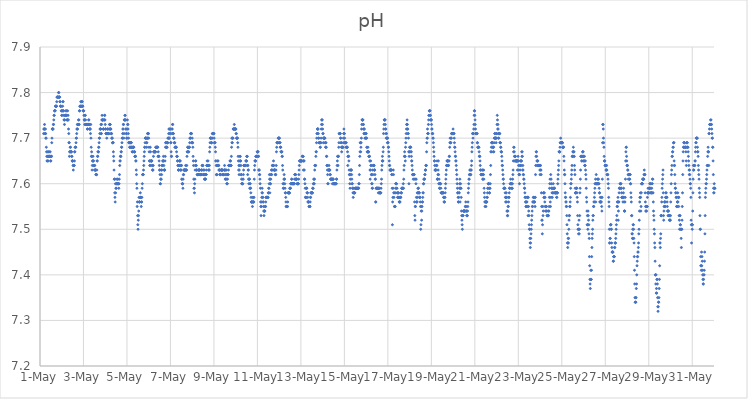
| Category | pH |
|---|---|
| 44317.166666666664 | 7.71 |
| 44317.177083333336 | 7.72 |
| 44317.1875 | 7.72 |
| 44317.197916666664 | 7.72 |
| 44317.208333333336 | 7.73 |
| 44317.21875 | 7.72 |
| 44317.229166666664 | 7.71 |
| 44317.239583333336 | 7.71 |
| 44317.25 | 7.72 |
| 44317.260416666664 | 7.71 |
| 44317.270833333336 | 7.7 |
| 44317.28125 | 7.7 |
| 44317.291666666664 | 7.68 |
| 44317.302083333336 | 7.67 |
| 44317.3125 | 7.66 |
| 44317.322916666664 | 7.65 |
| 44317.333333333336 | 7.65 |
| 44317.34375 | 7.66 |
| 44317.354166666664 | 7.67 |
| 44317.364583333336 | 7.66 |
| 44317.375 | 7.65 |
| 44317.385416666664 | 7.66 |
| 44317.395833333336 | 7.66 |
| 44317.40625 | 7.67 |
| 44317.416666666664 | 7.67 |
| 44317.427083333336 | 7.66 |
| 44317.4375 | 7.66 |
| 44317.447916666664 | 7.66 |
| 44317.458333333336 | 7.66 |
| 44317.46875 | 7.67 |
| 44317.479166666664 | 7.66 |
| 44317.489583333336 | 7.65 |
| 44317.5 | 7.65 |
| 44317.510416666664 | 7.66 |
| 44317.520833333336 | 7.66 |
| 44317.53125 | 7.66 |
| 44317.541666666664 | 7.69 |
| 44317.552083333336 | 7.7 |
| 44317.5625 | 7.72 |
| 44317.572916666664 | 7.72 |
| 44317.583333333336 | 7.72 |
| 44317.59375 | 7.72 |
| 44317.604166666664 | 7.72 |
| 44317.614583333336 | 7.73 |
| 44317.625 | 7.73 |
| 44317.635416666664 | 7.74 |
| 44317.645833333336 | 7.75 |
| 44317.65625 | 7.75 |
| 44317.666666666664 | 7.76 |
| 44317.677083333336 | 7.76 |
| 44317.6875 | 7.76 |
| 44317.697916666664 | 7.76 |
| 44317.708333333336 | 7.77 |
| 44317.71875 | 7.77 |
| 44317.729166666664 | 7.77 |
| 44317.739583333336 | 7.77 |
| 44317.75 | 7.77 |
| 44317.760416666664 | 7.77 |
| 44317.770833333336 | 7.78 |
| 44317.78125 | 7.79 |
| 44317.791666666664 | 7.79 |
| 44317.802083333336 | 7.79 |
| 44317.8125 | 7.79 |
| 44317.822916666664 | 7.79 |
| 44317.833333333336 | 7.79 |
| 44317.84375 | 7.79 |
| 44317.854166666664 | 7.8 |
| 44317.864583333336 | 7.8 |
| 44317.875 | 7.79 |
| 44317.885416666664 | 7.79 |
| 44317.895833333336 | 7.79 |
| 44317.90625 | 7.79 |
| 44317.916666666664 | 7.78 |
| 44317.927083333336 | 7.78 |
| 44317.9375 | 7.77 |
| 44317.947916666664 | 7.77 |
| 44317.958333333336 | 7.77 |
| 44317.96875 | 7.77 |
| 44317.979166666664 | 7.76 |
| 44317.989583333336 | 7.76 |
| 44318.0 | 7.75 |
| 44318.010416666664 | 7.75 |
| 44318.020833333336 | 7.76 |
| 44318.03125 | 7.76 |
| 44318.041666666664 | 7.77 |
| 44318.052083333336 | 7.78 |
| 44318.0625 | 7.78 |
| 44318.072916666664 | 7.76 |
| 44318.083333333336 | 7.76 |
| 44318.09375 | 7.75 |
| 44318.104166666664 | 7.74 |
| 44318.114583333336 | 7.74 |
| 44318.125 | 7.73 |
| 44318.135416666664 | 7.74 |
| 44318.145833333336 | 7.75 |
| 44318.15625 | 7.75 |
| 44318.166666666664 | 7.75 |
| 44318.177083333336 | 7.75 |
| 44318.1875 | 7.76 |
| 44318.197916666664 | 7.75 |
| 44318.208333333336 | 7.75 |
| 44318.21875 | 7.76 |
| 44318.229166666664 | 7.75 |
| 44318.239583333336 | 7.74 |
| 44318.25 | 7.74 |
| 44318.260416666664 | 7.74 |
| 44318.270833333336 | 7.76 |
| 44318.28125 | 7.74 |
| 44318.291666666664 | 7.75 |
| 44318.302083333336 | 7.74 |
| 44318.3125 | 7.72 |
| 44318.322916666664 | 7.71 |
| 44318.333333333336 | 7.69 |
| 44318.34375 | 7.69 |
| 44318.354166666664 | 7.66 |
| 44318.364583333336 | 7.67 |
| 44318.375 | 7.67 |
| 44318.385416666664 | 7.68 |
| 44318.395833333336 | 7.67 |
| 44318.40625 | 7.68 |
| 44318.416666666664 | 7.67 |
| 44318.427083333336 | 7.67 |
| 44318.4375 | 7.67 |
| 44318.447916666664 | 7.67 |
| 44318.458333333336 | 7.66 |
| 44318.46875 | 7.66 |
| 44318.479166666664 | 7.65 |
| 44318.489583333336 | 7.65 |
| 44318.5 | 7.65 |
| 44318.510416666664 | 7.65 |
| 44318.520833333336 | 7.64 |
| 44318.53125 | 7.63 |
| 44318.541666666664 | 7.64 |
| 44318.552083333336 | 7.64 |
| 44318.5625 | 7.64 |
| 44318.572916666664 | 7.64 |
| 44318.583333333336 | 7.65 |
| 44318.59375 | 7.67 |
| 44318.604166666664 | 7.67 |
| 44318.614583333336 | 7.68 |
| 44318.625 | 7.68 |
| 44318.635416666664 | 7.68 |
| 44318.645833333336 | 7.68 |
| 44318.65625 | 7.69 |
| 44318.666666666664 | 7.7 |
| 44318.677083333336 | 7.7 |
| 44318.6875 | 7.71 |
| 44318.697916666664 | 7.72 |
| 44318.708333333336 | 7.72 |
| 44318.71875 | 7.73 |
| 44318.729166666664 | 7.72 |
| 44318.739583333336 | 7.73 |
| 44318.75 | 7.73 |
| 44318.760416666664 | 7.73 |
| 44318.770833333336 | 7.74 |
| 44318.78125 | 7.73 |
| 44318.791666666664 | 7.74 |
| 44318.802083333336 | 7.73 |
| 44318.8125 | 7.76 |
| 44318.822916666664 | 7.76 |
| 44318.833333333336 | 7.77 |
| 44318.84375 | 7.77 |
| 44318.854166666664 | 7.77 |
| 44318.864583333336 | 7.77 |
| 44318.875 | 7.78 |
| 44318.885416666664 | 7.77 |
| 44318.895833333336 | 7.77 |
| 44318.90625 | 7.77 |
| 44318.916666666664 | 7.78 |
| 44318.927083333336 | 7.78 |
| 44318.9375 | 7.78 |
| 44318.947916666664 | 7.77 |
| 44318.958333333336 | 7.77 |
| 44318.96875 | 7.77 |
| 44318.979166666664 | 7.76 |
| 44318.989583333336 | 7.76 |
| 44319.0 | 7.76 |
| 44319.010416666664 | 7.76 |
| 44319.020833333336 | 7.75 |
| 44319.03125 | 7.74 |
| 44319.041666666664 | 7.74 |
| 44319.052083333336 | 7.73 |
| 44319.0625 | 7.74 |
| 44319.072916666664 | 7.75 |
| 44319.083333333336 | 7.75 |
| 44319.09375 | 7.74 |
| 44319.104166666664 | 7.73 |
| 44319.114583333336 | 7.73 |
| 44319.125 | 7.73 |
| 44319.135416666664 | 7.73 |
| 44319.145833333336 | 7.73 |
| 44319.15625 | 7.73 |
| 44319.166666666664 | 7.73 |
| 44319.177083333336 | 7.72 |
| 44319.1875 | 7.72 |
| 44319.197916666664 | 7.73 |
| 44319.208333333336 | 7.73 |
| 44319.21875 | 7.73 |
| 44319.229166666664 | 7.73 |
| 44319.239583333336 | 7.74 |
| 44319.25 | 7.74 |
| 44319.260416666664 | 7.73 |
| 44319.270833333336 | 7.73 |
| 44319.28125 | 7.72 |
| 44319.291666666664 | 7.72 |
| 44319.302083333336 | 7.72 |
| 44319.3125 | 7.72 |
| 44319.322916666664 | 7.71 |
| 44319.333333333336 | 7.73 |
| 44319.34375 | 7.7 |
| 44319.354166666664 | 7.68 |
| 44319.364583333336 | 7.66 |
| 44319.375 | 7.67 |
| 44319.385416666664 | 7.66 |
| 44319.395833333336 | 7.63 |
| 44319.40625 | 7.64 |
| 44319.416666666664 | 7.65 |
| 44319.427083333336 | 7.65 |
| 44319.4375 | 7.66 |
| 44319.447916666664 | 7.65 |
| 44319.458333333336 | 7.65 |
| 44319.46875 | 7.64 |
| 44319.479166666664 | 7.64 |
| 44319.489583333336 | 7.64 |
| 44319.5 | 7.64 |
| 44319.510416666664 | 7.63 |
| 44319.520833333336 | 7.64 |
| 44319.53125 | 7.63 |
| 44319.541666666664 | 7.63 |
| 44319.552083333336 | 7.63 |
| 44319.5625 | 7.63 |
| 44319.572916666664 | 7.62 |
| 44319.583333333336 | 7.62 |
| 44319.59375 | 7.62 |
| 44319.604166666664 | 7.62 |
| 44319.614583333336 | 7.63 |
| 44319.625 | 7.65 |
| 44319.635416666664 | 7.65 |
| 44319.645833333336 | 7.66 |
| 44319.65625 | 7.66 |
| 44319.666666666664 | 7.67 |
| 44319.677083333336 | 7.67 |
| 44319.6875 | 7.67 |
| 44319.697916666664 | 7.68 |
| 44319.708333333336 | 7.68 |
| 44319.71875 | 7.69 |
| 44319.729166666664 | 7.7 |
| 44319.739583333336 | 7.7 |
| 44319.75 | 7.71 |
| 44319.760416666664 | 7.72 |
| 44319.770833333336 | 7.72 |
| 44319.78125 | 7.72 |
| 44319.791666666664 | 7.72 |
| 44319.802083333336 | 7.73 |
| 44319.8125 | 7.71 |
| 44319.822916666664 | 7.71 |
| 44319.833333333336 | 7.73 |
| 44319.84375 | 7.74 |
| 44319.854166666664 | 7.75 |
| 44319.864583333336 | 7.74 |
| 44319.875 | 7.74 |
| 44319.885416666664 | 7.74 |
| 44319.895833333336 | 7.74 |
| 44319.90625 | 7.72 |
| 44319.916666666664 | 7.72 |
| 44319.927083333336 | 7.72 |
| 44319.9375 | 7.74 |
| 44319.947916666664 | 7.74 |
| 44319.958333333336 | 7.74 |
| 44319.96875 | 7.75 |
| 44319.979166666664 | 7.75 |
| 44319.989583333336 | 7.74 |
| 44320.0 | 7.73 |
| 44320.010416666664 | 7.72 |
| 44320.020833333336 | 7.72 |
| 44320.03125 | 7.71 |
| 44320.041666666664 | 7.71 |
| 44320.052083333336 | 7.71 |
| 44320.0625 | 7.71 |
| 44320.072916666664 | 7.7 |
| 44320.083333333336 | 7.71 |
| 44320.09375 | 7.71 |
| 44320.104166666664 | 7.72 |
| 44320.114583333336 | 7.72 |
| 44320.125 | 7.71 |
| 44320.135416666664 | 7.71 |
| 44320.145833333336 | 7.71 |
| 44320.15625 | 7.71 |
| 44320.166666666664 | 7.71 |
| 44320.177083333336 | 7.72 |
| 44320.1875 | 7.72 |
| 44320.197916666664 | 7.73 |
| 44320.208333333336 | 7.73 |
| 44320.21875 | 7.73 |
| 44320.229166666664 | 7.73 |
| 44320.239583333336 | 7.72 |
| 44320.25 | 7.72 |
| 44320.260416666664 | 7.72 |
| 44320.270833333336 | 7.71 |
| 44320.28125 | 7.71 |
| 44320.291666666664 | 7.71 |
| 44320.302083333336 | 7.7 |
| 44320.3125 | 7.7 |
| 44320.322916666664 | 7.7 |
| 44320.333333333336 | 7.69 |
| 44320.34375 | 7.69 |
| 44320.354166666664 | 7.69 |
| 44320.364583333336 | 7.69 |
| 44320.375 | 7.67 |
| 44320.385416666664 | 7.66 |
| 44320.395833333336 | 7.65 |
| 44320.40625 | 7.63 |
| 44320.416666666664 | 7.61 |
| 44320.427083333336 | 7.61 |
| 44320.4375 | 7.58 |
| 44320.447916666664 | 7.57 |
| 44320.458333333336 | 7.56 |
| 44320.46875 | 7.6 |
| 44320.479166666664 | 7.58 |
| 44320.489583333336 | 7.59 |
| 44320.5 | 7.61 |
| 44320.510416666664 | 7.59 |
| 44320.520833333336 | 7.6 |
| 44320.53125 | 7.6 |
| 44320.541666666664 | 7.6 |
| 44320.552083333336 | 7.6 |
| 44320.5625 | 7.6 |
| 44320.572916666664 | 7.61 |
| 44320.583333333336 | 7.61 |
| 44320.59375 | 7.6 |
| 44320.604166666664 | 7.6 |
| 44320.614583333336 | 7.6 |
| 44320.625 | 7.59 |
| 44320.635416666664 | 7.6 |
| 44320.645833333336 | 7.61 |
| 44320.65625 | 7.62 |
| 44320.666666666664 | 7.64 |
| 44320.677083333336 | 7.65 |
| 44320.6875 | 7.65 |
| 44320.697916666664 | 7.66 |
| 44320.708333333336 | 7.66 |
| 44320.71875 | 7.66 |
| 44320.729166666664 | 7.67 |
| 44320.739583333336 | 7.67 |
| 44320.75 | 7.68 |
| 44320.760416666664 | 7.68 |
| 44320.770833333336 | 7.69 |
| 44320.78125 | 7.7 |
| 44320.791666666664 | 7.7 |
| 44320.802083333336 | 7.71 |
| 44320.8125 | 7.72 |
| 44320.822916666664 | 7.72 |
| 44320.833333333336 | 7.73 |
| 44320.84375 | 7.73 |
| 44320.854166666664 | 7.7 |
| 44320.864583333336 | 7.71 |
| 44320.875 | 7.74 |
| 44320.885416666664 | 7.74 |
| 44320.895833333336 | 7.74 |
| 44320.90625 | 7.75 |
| 44320.916666666664 | 7.75 |
| 44320.927083333336 | 7.74 |
| 44320.9375 | 7.74 |
| 44320.947916666664 | 7.72 |
| 44320.958333333336 | 7.72 |
| 44320.96875 | 7.71 |
| 44320.979166666664 | 7.71 |
| 44320.989583333336 | 7.7 |
| 44321.0 | 7.7 |
| 44321.010416666664 | 7.72 |
| 44321.020833333336 | 7.74 |
| 44321.03125 | 7.73 |
| 44321.041666666664 | 7.73 |
| 44321.052083333336 | 7.72 |
| 44321.0625 | 7.71 |
| 44321.072916666664 | 7.7 |
| 44321.083333333336 | 7.69 |
| 44321.09375 | 7.69 |
| 44321.104166666664 | 7.69 |
| 44321.114583333336 | 7.69 |
| 44321.125 | 7.68 |
| 44321.135416666664 | 7.68 |
| 44321.145833333336 | 7.68 |
| 44321.15625 | 7.68 |
| 44321.166666666664 | 7.69 |
| 44321.177083333336 | 7.69 |
| 44321.1875 | 7.69 |
| 44321.197916666664 | 7.69 |
| 44321.208333333336 | 7.68 |
| 44321.21875 | 7.68 |
| 44321.229166666664 | 7.68 |
| 44321.239583333336 | 7.67 |
| 44321.25 | 7.67 |
| 44321.260416666664 | 7.68 |
| 44321.270833333336 | 7.68 |
| 44321.28125 | 7.68 |
| 44321.291666666664 | 7.68 |
| 44321.302083333336 | 7.68 |
| 44321.3125 | 7.68 |
| 44321.322916666664 | 7.67 |
| 44321.333333333336 | 7.67 |
| 44321.34375 | 7.67 |
| 44321.354166666664 | 7.67 |
| 44321.364583333336 | 7.66 |
| 44321.375 | 7.66 |
| 44321.385416666664 | 7.66 |
| 44321.395833333336 | 7.66 |
| 44321.40625 | 7.65 |
| 44321.416666666664 | 7.65 |
| 44321.427083333336 | 7.63 |
| 44321.4375 | 7.62 |
| 44321.447916666664 | 7.6 |
| 44321.458333333336 | 7.59 |
| 44321.46875 | 7.55 |
| 44321.479166666664 | 7.56 |
| 44321.489583333336 | 7.53 |
| 44321.5 | 7.51 |
| 44321.510416666664 | 7.5 |
| 44321.520833333336 | 7.52 |
| 44321.53125 | 7.53 |
| 44321.541666666664 | 7.54 |
| 44321.552083333336 | 7.57 |
| 44321.5625 | 7.56 |
| 44321.572916666664 | 7.56 |
| 44321.583333333336 | 7.56 |
| 44321.59375 | 7.57 |
| 44321.604166666664 | 7.57 |
| 44321.614583333336 | 7.58 |
| 44321.625 | 7.57 |
| 44321.635416666664 | 7.57 |
| 44321.645833333336 | 7.57 |
| 44321.65625 | 7.55 |
| 44321.666666666664 | 7.56 |
| 44321.677083333336 | 7.56 |
| 44321.6875 | 7.57 |
| 44321.697916666664 | 7.59 |
| 44321.708333333336 | 7.6 |
| 44321.71875 | 7.62 |
| 44321.729166666664 | 7.62 |
| 44321.739583333336 | 7.62 |
| 44321.75 | 7.62 |
| 44321.760416666664 | 7.63 |
| 44321.770833333336 | 7.64 |
| 44321.78125 | 7.65 |
| 44321.791666666664 | 7.66 |
| 44321.802083333336 | 7.67 |
| 44321.8125 | 7.68 |
| 44321.822916666664 | 7.68 |
| 44321.833333333336 | 7.69 |
| 44321.84375 | 7.7 |
| 44321.854166666664 | 7.7 |
| 44321.864583333336 | 7.7 |
| 44321.875 | 7.7 |
| 44321.885416666664 | 7.7 |
| 44321.895833333336 | 7.69 |
| 44321.90625 | 7.68 |
| 44321.916666666664 | 7.69 |
| 44321.927083333336 | 7.7 |
| 44321.9375 | 7.7 |
| 44321.947916666664 | 7.71 |
| 44321.958333333336 | 7.71 |
| 44321.96875 | 7.7 |
| 44321.979166666664 | 7.71 |
| 44321.989583333336 | 7.71 |
| 44322.0 | 7.7 |
| 44322.010416666664 | 7.68 |
| 44322.020833333336 | 7.67 |
| 44322.03125 | 7.65 |
| 44322.041666666664 | 7.65 |
| 44322.052083333336 | 7.64 |
| 44322.0625 | 7.64 |
| 44322.072916666664 | 7.68 |
| 44322.083333333336 | 7.67 |
| 44322.09375 | 7.65 |
| 44322.104166666664 | 7.65 |
| 44322.114583333336 | 7.65 |
| 44322.125 | 7.65 |
| 44322.135416666664 | 7.65 |
| 44322.145833333336 | 7.65 |
| 44322.15625 | 7.64 |
| 44322.166666666664 | 7.64 |
| 44322.177083333336 | 7.63 |
| 44322.1875 | 7.63 |
| 44322.197916666664 | 7.63 |
| 44322.208333333336 | 7.64 |
| 44322.21875 | 7.66 |
| 44322.229166666664 | 7.67 |
| 44322.239583333336 | 7.67 |
| 44322.25 | 7.67 |
| 44322.260416666664 | 7.67 |
| 44322.270833333336 | 7.67 |
| 44322.28125 | 7.67 |
| 44322.291666666664 | 7.67 |
| 44322.302083333336 | 7.67 |
| 44322.3125 | 7.67 |
| 44322.322916666664 | 7.68 |
| 44322.333333333336 | 7.68 |
| 44322.34375 | 7.68 |
| 44322.354166666664 | 7.68 |
| 44322.364583333336 | 7.68 |
| 44322.375 | 7.68 |
| 44322.385416666664 | 7.68 |
| 44322.395833333336 | 7.68 |
| 44322.40625 | 7.68 |
| 44322.416666666664 | 7.68 |
| 44322.427083333336 | 7.66 |
| 44322.4375 | 7.67 |
| 44322.447916666664 | 7.66 |
| 44322.458333333336 | 7.66 |
| 44322.46875 | 7.66 |
| 44322.479166666664 | 7.65 |
| 44322.489583333336 | 7.64 |
| 44322.5 | 7.63 |
| 44322.510416666664 | 7.63 |
| 44322.520833333336 | 7.62 |
| 44322.53125 | 7.6 |
| 44322.541666666664 | 7.6 |
| 44322.552083333336 | 7.61 |
| 44322.5625 | 7.61 |
| 44322.572916666664 | 7.61 |
| 44322.583333333336 | 7.63 |
| 44322.59375 | 7.62 |
| 44322.604166666664 | 7.63 |
| 44322.614583333336 | 7.64 |
| 44322.625 | 7.64 |
| 44322.635416666664 | 7.64 |
| 44322.645833333336 | 7.65 |
| 44322.65625 | 7.65 |
| 44322.666666666664 | 7.65 |
| 44322.677083333336 | 7.66 |
| 44322.6875 | 7.65 |
| 44322.697916666664 | 7.64 |
| 44322.708333333336 | 7.63 |
| 44322.71875 | 7.63 |
| 44322.729166666664 | 7.63 |
| 44322.739583333336 | 7.63 |
| 44322.75 | 7.65 |
| 44322.760416666664 | 7.66 |
| 44322.770833333336 | 7.68 |
| 44322.78125 | 7.69 |
| 44322.791666666664 | 7.69 |
| 44322.802083333336 | 7.69 |
| 44322.8125 | 7.68 |
| 44322.822916666664 | 7.68 |
| 44322.833333333336 | 7.68 |
| 44322.84375 | 7.68 |
| 44322.854166666664 | 7.69 |
| 44322.864583333336 | 7.69 |
| 44322.875 | 7.69 |
| 44322.885416666664 | 7.7 |
| 44322.895833333336 | 7.7 |
| 44322.90625 | 7.7 |
| 44322.916666666664 | 7.71 |
| 44322.927083333336 | 7.72 |
| 44322.9375 | 7.7 |
| 44322.947916666664 | 7.7 |
| 44322.958333333336 | 7.71 |
| 44322.96875 | 7.72 |
| 44322.979166666664 | 7.72 |
| 44322.989583333336 | 7.72 |
| 44323.0 | 7.71 |
| 44323.010416666664 | 7.69 |
| 44323.020833333336 | 7.69 |
| 44323.03125 | 7.67 |
| 44323.041666666664 | 7.66 |
| 44323.052083333336 | 7.66 |
| 44323.0625 | 7.72 |
| 44323.072916666664 | 7.71 |
| 44323.083333333336 | 7.72 |
| 44323.09375 | 7.73 |
| 44323.104166666664 | 7.73 |
| 44323.114583333336 | 7.71 |
| 44323.125 | 7.71 |
| 44323.135416666664 | 7.71 |
| 44323.145833333336 | 7.7 |
| 44323.15625 | 7.7 |
| 44323.166666666664 | 7.7 |
| 44323.177083333336 | 7.69 |
| 44323.1875 | 7.69 |
| 44323.197916666664 | 7.69 |
| 44323.208333333336 | 7.68 |
| 44323.21875 | 7.68 |
| 44323.229166666664 | 7.68 |
| 44323.239583333336 | 7.68 |
| 44323.25 | 7.68 |
| 44323.260416666664 | 7.68 |
| 44323.270833333336 | 7.68 |
| 44323.28125 | 7.67 |
| 44323.291666666664 | 7.66 |
| 44323.302083333336 | 7.66 |
| 44323.3125 | 7.66 |
| 44323.322916666664 | 7.65 |
| 44323.333333333336 | 7.65 |
| 44323.34375 | 7.64 |
| 44323.354166666664 | 7.64 |
| 44323.364583333336 | 7.63 |
| 44323.375 | 7.63 |
| 44323.385416666664 | 7.63 |
| 44323.395833333336 | 7.64 |
| 44323.40625 | 7.64 |
| 44323.416666666664 | 7.65 |
| 44323.427083333336 | 7.65 |
| 44323.4375 | 7.65 |
| 44323.447916666664 | 7.65 |
| 44323.458333333336 | 7.63 |
| 44323.46875 | 7.64 |
| 44323.479166666664 | 7.63 |
| 44323.489583333336 | 7.63 |
| 44323.5 | 7.64 |
| 44323.510416666664 | 7.64 |
| 44323.520833333336 | 7.61 |
| 44323.53125 | 7.61 |
| 44323.541666666664 | 7.6 |
| 44323.552083333336 | 7.6 |
| 44323.5625 | 7.6 |
| 44323.572916666664 | 7.59 |
| 44323.583333333336 | 7.61 |
| 44323.59375 | 7.62 |
| 44323.604166666664 | 7.62 |
| 44323.614583333336 | 7.63 |
| 44323.625 | 7.63 |
| 44323.635416666664 | 7.63 |
| 44323.645833333336 | 7.63 |
| 44323.65625 | 7.63 |
| 44323.666666666664 | 7.63 |
| 44323.677083333336 | 7.63 |
| 44323.6875 | 7.63 |
| 44323.697916666664 | 7.64 |
| 44323.708333333336 | 7.63 |
| 44323.71875 | 7.63 |
| 44323.729166666664 | 7.63 |
| 44323.739583333336 | 7.63 |
| 44323.75 | 7.64 |
| 44323.760416666664 | 7.66 |
| 44323.770833333336 | 7.67 |
| 44323.78125 | 7.67 |
| 44323.791666666664 | 7.68 |
| 44323.802083333336 | 7.68 |
| 44323.8125 | 7.68 |
| 44323.822916666664 | 7.67 |
| 44323.833333333336 | 7.68 |
| 44323.84375 | 7.67 |
| 44323.854166666664 | 7.68 |
| 44323.864583333336 | 7.68 |
| 44323.875 | 7.68 |
| 44323.885416666664 | 7.69 |
| 44323.895833333336 | 7.7 |
| 44323.90625 | 7.7 |
| 44323.916666666664 | 7.7 |
| 44323.927083333336 | 7.71 |
| 44323.9375 | 7.71 |
| 44323.947916666664 | 7.71 |
| 44323.958333333336 | 7.71 |
| 44323.96875 | 7.71 |
| 44323.979166666664 | 7.69 |
| 44323.989583333336 | 7.69 |
| 44324.0 | 7.7 |
| 44324.010416666664 | 7.69 |
| 44324.020833333336 | 7.69 |
| 44324.03125 | 7.68 |
| 44324.041666666664 | 7.66 |
| 44324.052083333336 | 7.65 |
| 44324.0625 | 7.64 |
| 44324.072916666664 | 7.61 |
| 44324.083333333336 | 7.59 |
| 44324.09375 | 7.59 |
| 44324.104166666664 | 7.58 |
| 44324.114583333336 | 7.6 |
| 44324.125 | 7.61 |
| 44324.135416666664 | 7.63 |
| 44324.145833333336 | 7.64 |
| 44324.15625 | 7.65 |
| 44324.166666666664 | 7.65 |
| 44324.177083333336 | 7.64 |
| 44324.1875 | 7.64 |
| 44324.197916666664 | 7.63 |
| 44324.208333333336 | 7.63 |
| 44324.21875 | 7.63 |
| 44324.229166666664 | 7.62 |
| 44324.239583333336 | 7.62 |
| 44324.25 | 7.62 |
| 44324.260416666664 | 7.62 |
| 44324.270833333336 | 7.62 |
| 44324.28125 | 7.62 |
| 44324.291666666664 | 7.63 |
| 44324.302083333336 | 7.63 |
| 44324.3125 | 7.63 |
| 44324.322916666664 | 7.63 |
| 44324.333333333336 | 7.63 |
| 44324.34375 | 7.63 |
| 44324.354166666664 | 7.62 |
| 44324.364583333336 | 7.62 |
| 44324.375 | 7.62 |
| 44324.385416666664 | 7.62 |
| 44324.395833333336 | 7.62 |
| 44324.40625 | 7.62 |
| 44324.416666666664 | 7.62 |
| 44324.427083333336 | 7.63 |
| 44324.4375 | 7.63 |
| 44324.447916666664 | 7.63 |
| 44324.458333333336 | 7.64 |
| 44324.46875 | 7.64 |
| 44324.479166666664 | 7.64 |
| 44324.489583333336 | 7.64 |
| 44324.5 | 7.62 |
| 44324.510416666664 | 7.62 |
| 44324.520833333336 | 7.63 |
| 44324.53125 | 7.62 |
| 44324.541666666664 | 7.62 |
| 44324.552083333336 | 7.63 |
| 44324.5625 | 7.61 |
| 44324.572916666664 | 7.62 |
| 44324.583333333336 | 7.61 |
| 44324.59375 | 7.61 |
| 44324.604166666664 | 7.61 |
| 44324.614583333336 | 7.61 |
| 44324.625 | 7.62 |
| 44324.635416666664 | 7.62 |
| 44324.645833333336 | 7.62 |
| 44324.65625 | 7.63 |
| 44324.666666666664 | 7.64 |
| 44324.677083333336 | 7.64 |
| 44324.6875 | 7.65 |
| 44324.697916666664 | 7.64 |
| 44324.708333333336 | 7.64 |
| 44324.71875 | 7.64 |
| 44324.729166666664 | 7.65 |
| 44324.739583333336 | 7.64 |
| 44324.75 | 7.64 |
| 44324.760416666664 | 7.63 |
| 44324.770833333336 | 7.63 |
| 44324.78125 | 7.63 |
| 44324.791666666664 | 7.64 |
| 44324.802083333336 | 7.67 |
| 44324.8125 | 7.68 |
| 44324.822916666664 | 7.69 |
| 44324.833333333336 | 7.7 |
| 44324.84375 | 7.7 |
| 44324.854166666664 | 7.7 |
| 44324.864583333336 | 7.7 |
| 44324.875 | 7.69 |
| 44324.885416666664 | 7.69 |
| 44324.895833333336 | 7.69 |
| 44324.90625 | 7.7 |
| 44324.916666666664 | 7.7 |
| 44324.927083333336 | 7.71 |
| 44324.9375 | 7.71 |
| 44324.947916666664 | 7.71 |
| 44324.958333333336 | 7.71 |
| 44324.96875 | 7.71 |
| 44324.979166666664 | 7.71 |
| 44324.989583333336 | 7.71 |
| 44325.0 | 7.71 |
| 44325.010416666664 | 7.7 |
| 44325.020833333336 | 7.69 |
| 44325.03125 | 7.69 |
| 44325.041666666664 | 7.69 |
| 44325.052083333336 | 7.69 |
| 44325.0625 | 7.68 |
| 44325.072916666664 | 7.67 |
| 44325.083333333336 | 7.65 |
| 44325.09375 | 7.65 |
| 44325.104166666664 | 7.64 |
| 44325.114583333336 | 7.62 |
| 44325.125 | 7.62 |
| 44325.135416666664 | 7.62 |
| 44325.145833333336 | 7.64 |
| 44325.15625 | 7.64 |
| 44325.166666666664 | 7.64 |
| 44325.177083333336 | 7.65 |
| 44325.1875 | 7.65 |
| 44325.197916666664 | 7.64 |
| 44325.208333333336 | 7.64 |
| 44325.21875 | 7.64 |
| 44325.229166666664 | 7.63 |
| 44325.239583333336 | 7.63 |
| 44325.25 | 7.63 |
| 44325.260416666664 | 7.63 |
| 44325.270833333336 | 7.62 |
| 44325.28125 | 7.62 |
| 44325.291666666664 | 7.62 |
| 44325.302083333336 | 7.62 |
| 44325.3125 | 7.62 |
| 44325.322916666664 | 7.63 |
| 44325.333333333336 | 7.63 |
| 44325.34375 | 7.63 |
| 44325.354166666664 | 7.63 |
| 44325.364583333336 | 7.63 |
| 44325.375 | 7.63 |
| 44325.385416666664 | 7.63 |
| 44325.395833333336 | 7.63 |
| 44325.40625 | 7.62 |
| 44325.416666666664 | 7.62 |
| 44325.427083333336 | 7.62 |
| 44325.4375 | 7.62 |
| 44325.447916666664 | 7.62 |
| 44325.458333333336 | 7.62 |
| 44325.46875 | 7.63 |
| 44325.479166666664 | 7.63 |
| 44325.489583333336 | 7.64 |
| 44325.5 | 7.63 |
| 44325.510416666664 | 7.63 |
| 44325.520833333336 | 7.61 |
| 44325.53125 | 7.61 |
| 44325.541666666664 | 7.62 |
| 44325.552083333336 | 7.63 |
| 44325.5625 | 7.63 |
| 44325.572916666664 | 7.62 |
| 44325.583333333336 | 7.61 |
| 44325.59375 | 7.6 |
| 44325.604166666664 | 7.6 |
| 44325.614583333336 | 7.6 |
| 44325.625 | 7.61 |
| 44325.635416666664 | 7.62 |
| 44325.645833333336 | 7.62 |
| 44325.65625 | 7.62 |
| 44325.666666666664 | 7.63 |
| 44325.677083333336 | 7.64 |
| 44325.6875 | 7.64 |
| 44325.697916666664 | 7.64 |
| 44325.708333333336 | 7.64 |
| 44325.71875 | 7.64 |
| 44325.729166666664 | 7.64 |
| 44325.739583333336 | 7.65 |
| 44325.75 | 7.65 |
| 44325.760416666664 | 7.65 |
| 44325.770833333336 | 7.64 |
| 44325.78125 | 7.64 |
| 44325.791666666664 | 7.64 |
| 44325.802083333336 | 7.66 |
| 44325.8125 | 7.68 |
| 44325.822916666664 | 7.7 |
| 44325.833333333336 | 7.69 |
| 44325.84375 | 7.69 |
| 44325.854166666664 | 7.7 |
| 44325.864583333336 | 7.7 |
| 44325.875 | 7.7 |
| 44325.885416666664 | 7.72 |
| 44325.895833333336 | 7.72 |
| 44325.90625 | 7.72 |
| 44325.916666666664 | 7.72 |
| 44325.927083333336 | 7.72 |
| 44325.9375 | 7.73 |
| 44325.947916666664 | 7.72 |
| 44325.958333333336 | 7.72 |
| 44325.96875 | 7.72 |
| 44325.979166666664 | 7.72 |
| 44325.989583333336 | 7.72 |
| 44326.0 | 7.72 |
| 44326.010416666664 | 7.72 |
| 44326.020833333336 | 7.71 |
| 44326.03125 | 7.71 |
| 44326.041666666664 | 7.7 |
| 44326.052083333336 | 7.7 |
| 44326.0625 | 7.7 |
| 44326.072916666664 | 7.7 |
| 44326.083333333336 | 7.7 |
| 44326.09375 | 7.69 |
| 44326.104166666664 | 7.68 |
| 44326.114583333336 | 7.66 |
| 44326.125 | 7.65 |
| 44326.135416666664 | 7.63 |
| 44326.145833333336 | 7.64 |
| 44326.15625 | 7.62 |
| 44326.166666666664 | 7.63 |
| 44326.177083333336 | 7.64 |
| 44326.1875 | 7.65 |
| 44326.197916666664 | 7.66 |
| 44326.208333333336 | 7.66 |
| 44326.21875 | 7.65 |
| 44326.229166666664 | 7.65 |
| 44326.239583333336 | 7.64 |
| 44326.25 | 7.62 |
| 44326.260416666664 | 7.62 |
| 44326.270833333336 | 7.61 |
| 44326.28125 | 7.6 |
| 44326.291666666664 | 7.6 |
| 44326.302083333336 | 7.6 |
| 44326.3125 | 7.6 |
| 44326.322916666664 | 7.6 |
| 44326.333333333336 | 7.61 |
| 44326.34375 | 7.61 |
| 44326.354166666664 | 7.62 |
| 44326.364583333336 | 7.63 |
| 44326.375 | 7.64 |
| 44326.385416666664 | 7.64 |
| 44326.395833333336 | 7.64 |
| 44326.40625 | 7.64 |
| 44326.416666666664 | 7.64 |
| 44326.427083333336 | 7.64 |
| 44326.4375 | 7.64 |
| 44326.447916666664 | 7.64 |
| 44326.458333333336 | 7.64 |
| 44326.46875 | 7.65 |
| 44326.479166666664 | 7.65 |
| 44326.489583333336 | 7.65 |
| 44326.5 | 7.65 |
| 44326.510416666664 | 7.66 |
| 44326.520833333336 | 7.66 |
| 44326.53125 | 7.66 |
| 44326.541666666664 | 7.64 |
| 44326.552083333336 | 7.62 |
| 44326.5625 | 7.64 |
| 44326.572916666664 | 7.63 |
| 44326.583333333336 | 7.63 |
| 44326.59375 | 7.61 |
| 44326.604166666664 | 7.6 |
| 44326.614583333336 | 7.61 |
| 44326.625 | 7.61 |
| 44326.635416666664 | 7.61 |
| 44326.645833333336 | 7.59 |
| 44326.65625 | 7.6 |
| 44326.666666666664 | 7.6 |
| 44326.677083333336 | 7.59 |
| 44326.6875 | 7.59 |
| 44326.697916666664 | 7.58 |
| 44326.708333333336 | 7.57 |
| 44326.71875 | 7.56 |
| 44326.729166666664 | 7.56 |
| 44326.739583333336 | 7.56 |
| 44326.75 | 7.56 |
| 44326.760416666664 | 7.56 |
| 44326.770833333336 | 7.55 |
| 44326.78125 | 7.56 |
| 44326.791666666664 | 7.57 |
| 44326.802083333336 | 7.57 |
| 44326.8125 | 7.56 |
| 44326.822916666664 | 7.56 |
| 44326.833333333336 | 7.56 |
| 44326.84375 | 7.57 |
| 44326.854166666664 | 7.61 |
| 44326.864583333336 | 7.63 |
| 44326.875 | 7.64 |
| 44326.885416666664 | 7.65 |
| 44326.895833333336 | 7.65 |
| 44326.90625 | 7.65 |
| 44326.916666666664 | 7.65 |
| 44326.927083333336 | 7.66 |
| 44326.9375 | 7.66 |
| 44326.947916666664 | 7.66 |
| 44326.958333333336 | 7.66 |
| 44326.96875 | 7.66 |
| 44326.979166666664 | 7.66 |
| 44326.989583333336 | 7.67 |
| 44327.0 | 7.67 |
| 44327.010416666664 | 7.67 |
| 44327.020833333336 | 7.67 |
| 44327.03125 | 7.67 |
| 44327.041666666664 | 7.66 |
| 44327.052083333336 | 7.66 |
| 44327.0625 | 7.63 |
| 44327.072916666664 | 7.63 |
| 44327.083333333336 | 7.63 |
| 44327.09375 | 7.62 |
| 44327.104166666664 | 7.62 |
| 44327.114583333336 | 7.61 |
| 44327.125 | 7.6 |
| 44327.135416666664 | 7.59 |
| 44327.145833333336 | 7.56 |
| 44327.15625 | 7.55 |
| 44327.166666666664 | 7.53 |
| 44327.177083333336 | 7.55 |
| 44327.1875 | 7.56 |
| 44327.197916666664 | 7.57 |
| 44327.208333333336 | 7.58 |
| 44327.21875 | 7.59 |
| 44327.229166666664 | 7.58 |
| 44327.239583333336 | 7.57 |
| 44327.25 | 7.57 |
| 44327.260416666664 | 7.56 |
| 44327.270833333336 | 7.56 |
| 44327.28125 | 7.55 |
| 44327.291666666664 | 7.54 |
| 44327.302083333336 | 7.53 |
| 44327.3125 | 7.54 |
| 44327.322916666664 | 7.54 |
| 44327.333333333336 | 7.54 |
| 44327.34375 | 7.54 |
| 44327.354166666664 | 7.55 |
| 44327.364583333336 | 7.55 |
| 44327.375 | 7.55 |
| 44327.385416666664 | 7.56 |
| 44327.395833333336 | 7.57 |
| 44327.40625 | 7.57 |
| 44327.416666666664 | 7.57 |
| 44327.427083333336 | 7.57 |
| 44327.4375 | 7.57 |
| 44327.447916666664 | 7.57 |
| 44327.458333333336 | 7.57 |
| 44327.46875 | 7.57 |
| 44327.479166666664 | 7.57 |
| 44327.489583333336 | 7.57 |
| 44327.5 | 7.58 |
| 44327.510416666664 | 7.58 |
| 44327.520833333336 | 7.59 |
| 44327.53125 | 7.59 |
| 44327.541666666664 | 7.6 |
| 44327.552083333336 | 7.62 |
| 44327.5625 | 7.61 |
| 44327.572916666664 | 7.58 |
| 44327.583333333336 | 7.61 |
| 44327.59375 | 7.6 |
| 44327.604166666664 | 7.6 |
| 44327.614583333336 | 7.61 |
| 44327.625 | 7.62 |
| 44327.635416666664 | 7.62 |
| 44327.645833333336 | 7.63 |
| 44327.65625 | 7.62 |
| 44327.666666666664 | 7.63 |
| 44327.677083333336 | 7.63 |
| 44327.6875 | 7.64 |
| 44327.697916666664 | 7.64 |
| 44327.708333333336 | 7.64 |
| 44327.71875 | 7.64 |
| 44327.729166666664 | 7.64 |
| 44327.739583333336 | 7.65 |
| 44327.75 | 7.64 |
| 44327.760416666664 | 7.63 |
| 44327.770833333336 | 7.63 |
| 44327.78125 | 7.63 |
| 44327.791666666664 | 7.63 |
| 44327.802083333336 | 7.63 |
| 44327.8125 | 7.63 |
| 44327.822916666664 | 7.62 |
| 44327.833333333336 | 7.62 |
| 44327.84375 | 7.62 |
| 44327.854166666664 | 7.63 |
| 44327.864583333336 | 7.64 |
| 44327.875 | 7.67 |
| 44327.885416666664 | 7.68 |
| 44327.895833333336 | 7.69 |
| 44327.90625 | 7.69 |
| 44327.916666666664 | 7.69 |
| 44327.927083333336 | 7.69 |
| 44327.9375 | 7.69 |
| 44327.947916666664 | 7.69 |
| 44327.958333333336 | 7.7 |
| 44327.96875 | 7.7 |
| 44327.979166666664 | 7.7 |
| 44327.989583333336 | 7.7 |
| 44328.0 | 7.7 |
| 44328.010416666664 | 7.7 |
| 44328.020833333336 | 7.69 |
| 44328.03125 | 7.69 |
| 44328.041666666664 | 7.69 |
| 44328.052083333336 | 7.68 |
| 44328.0625 | 7.68 |
| 44328.072916666664 | 7.68 |
| 44328.083333333336 | 7.67 |
| 44328.09375 | 7.67 |
| 44328.104166666664 | 7.67 |
| 44328.114583333336 | 7.67 |
| 44328.125 | 7.67 |
| 44328.135416666664 | 7.66 |
| 44328.145833333336 | 7.66 |
| 44328.15625 | 7.64 |
| 44328.166666666664 | 7.63 |
| 44328.177083333336 | 7.6 |
| 44328.1875 | 7.59 |
| 44328.197916666664 | 7.6 |
| 44328.208333333336 | 7.59 |
| 44328.21875 | 7.61 |
| 44328.229166666664 | 7.62 |
| 44328.239583333336 | 7.61 |
| 44328.25 | 7.61 |
| 44328.260416666664 | 7.6 |
| 44328.270833333336 | 7.59 |
| 44328.28125 | 7.58 |
| 44328.291666666664 | 7.58 |
| 44328.302083333336 | 7.57 |
| 44328.3125 | 7.56 |
| 44328.322916666664 | 7.55 |
| 44328.333333333336 | 7.55 |
| 44328.34375 | 7.55 |
| 44328.354166666664 | 7.55 |
| 44328.364583333336 | 7.55 |
| 44328.375 | 7.55 |
| 44328.385416666664 | 7.55 |
| 44328.395833333336 | 7.56 |
| 44328.40625 | 7.58 |
| 44328.416666666664 | 7.58 |
| 44328.427083333336 | 7.58 |
| 44328.4375 | 7.58 |
| 44328.447916666664 | 7.58 |
| 44328.458333333336 | 7.58 |
| 44328.46875 | 7.58 |
| 44328.479166666664 | 7.58 |
| 44328.489583333336 | 7.59 |
| 44328.5 | 7.59 |
| 44328.510416666664 | 7.59 |
| 44328.520833333336 | 7.59 |
| 44328.53125 | 7.6 |
| 44328.541666666664 | 7.6 |
| 44328.552083333336 | 7.6 |
| 44328.5625 | 7.6 |
| 44328.572916666664 | 7.61 |
| 44328.583333333336 | 7.61 |
| 44328.59375 | 7.6 |
| 44328.604166666664 | 7.6 |
| 44328.614583333336 | 7.6 |
| 44328.625 | 7.6 |
| 44328.635416666664 | 7.6 |
| 44328.645833333336 | 7.6 |
| 44328.65625 | 7.6 |
| 44328.666666666664 | 7.6 |
| 44328.677083333336 | 7.6 |
| 44328.6875 | 7.6 |
| 44328.697916666664 | 7.6 |
| 44328.708333333336 | 7.61 |
| 44328.71875 | 7.62 |
| 44328.729166666664 | 7.62 |
| 44328.739583333336 | 7.62 |
| 44328.75 | 7.61 |
| 44328.760416666664 | 7.62 |
| 44328.770833333336 | 7.61 |
| 44328.78125 | 7.61 |
| 44328.791666666664 | 7.61 |
| 44328.802083333336 | 7.61 |
| 44328.8125 | 7.61 |
| 44328.822916666664 | 7.6 |
| 44328.833333333336 | 7.6 |
| 44328.84375 | 7.6 |
| 44328.854166666664 | 7.6 |
| 44328.864583333336 | 7.6 |
| 44328.875 | 7.6 |
| 44328.885416666664 | 7.6 |
| 44328.895833333336 | 7.61 |
| 44328.90625 | 7.62 |
| 44328.916666666664 | 7.63 |
| 44328.927083333336 | 7.64 |
| 44328.9375 | 7.65 |
| 44328.947916666664 | 7.65 |
| 44328.958333333336 | 7.65 |
| 44328.96875 | 7.65 |
| 44328.979166666664 | 7.65 |
| 44328.989583333336 | 7.65 |
| 44329.0 | 7.65 |
| 44329.010416666664 | 7.65 |
| 44329.020833333336 | 7.65 |
| 44329.03125 | 7.65 |
| 44329.041666666664 | 7.65 |
| 44329.052083333336 | 7.65 |
| 44329.0625 | 7.66 |
| 44329.072916666664 | 7.66 |
| 44329.083333333336 | 7.66 |
| 44329.09375 | 7.66 |
| 44329.104166666664 | 7.66 |
| 44329.114583333336 | 7.63 |
| 44329.125 | 7.65 |
| 44329.135416666664 | 7.65 |
| 44329.145833333336 | 7.65 |
| 44329.15625 | 7.63 |
| 44329.166666666664 | 7.61 |
| 44329.177083333336 | 7.61 |
| 44329.1875 | 7.6 |
| 44329.197916666664 | 7.59 |
| 44329.208333333336 | 7.57 |
| 44329.21875 | 7.57 |
| 44329.229166666664 | 7.57 |
| 44329.239583333336 | 7.57 |
| 44329.25 | 7.59 |
| 44329.260416666664 | 7.59 |
| 44329.270833333336 | 7.59 |
| 44329.28125 | 7.58 |
| 44329.291666666664 | 7.58 |
| 44329.302083333336 | 7.58 |
| 44329.3125 | 7.57 |
| 44329.322916666664 | 7.56 |
| 44329.333333333336 | 7.56 |
| 44329.34375 | 7.56 |
| 44329.354166666664 | 7.56 |
| 44329.364583333336 | 7.56 |
| 44329.375 | 7.55 |
| 44329.385416666664 | 7.55 |
| 44329.395833333336 | 7.55 |
| 44329.40625 | 7.55 |
| 44329.416666666664 | 7.55 |
| 44329.427083333336 | 7.56 |
| 44329.4375 | 7.57 |
| 44329.447916666664 | 7.57 |
| 44329.458333333336 | 7.58 |
| 44329.46875 | 7.58 |
| 44329.479166666664 | 7.58 |
| 44329.489583333336 | 7.58 |
| 44329.5 | 7.58 |
| 44329.510416666664 | 7.58 |
| 44329.520833333336 | 7.58 |
| 44329.53125 | 7.58 |
| 44329.541666666664 | 7.59 |
| 44329.552083333336 | 7.59 |
| 44329.5625 | 7.59 |
| 44329.572916666664 | 7.6 |
| 44329.583333333336 | 7.6 |
| 44329.59375 | 7.61 |
| 44329.604166666664 | 7.61 |
| 44329.614583333336 | 7.6 |
| 44329.625 | 7.61 |
| 44329.635416666664 | 7.63 |
| 44329.645833333336 | 7.64 |
| 44329.65625 | 7.64 |
| 44329.666666666664 | 7.64 |
| 44329.677083333336 | 7.64 |
| 44329.6875 | 7.66 |
| 44329.697916666664 | 7.67 |
| 44329.708333333336 | 7.67 |
| 44329.71875 | 7.69 |
| 44329.729166666664 | 7.7 |
| 44329.739583333336 | 7.71 |
| 44329.75 | 7.71 |
| 44329.760416666664 | 7.72 |
| 44329.770833333336 | 7.72 |
| 44329.78125 | 7.72 |
| 44329.791666666664 | 7.72 |
| 44329.802083333336 | 7.71 |
| 44329.8125 | 7.7 |
| 44329.822916666664 | 7.7 |
| 44329.833333333336 | 7.69 |
| 44329.84375 | 7.69 |
| 44329.854166666664 | 7.69 |
| 44329.864583333336 | 7.69 |
| 44329.875 | 7.69 |
| 44329.885416666664 | 7.68 |
| 44329.895833333336 | 7.68 |
| 44329.90625 | 7.69 |
| 44329.916666666664 | 7.69 |
| 44329.927083333336 | 7.7 |
| 44329.9375 | 7.72 |
| 44329.947916666664 | 7.73 |
| 44329.958333333336 | 7.74 |
| 44329.96875 | 7.74 |
| 44329.979166666664 | 7.74 |
| 44329.989583333336 | 7.73 |
| 44330.0 | 7.72 |
| 44330.010416666664 | 7.71 |
| 44330.020833333336 | 7.71 |
| 44330.03125 | 7.69 |
| 44330.041666666664 | 7.7 |
| 44330.052083333336 | 7.7 |
| 44330.0625 | 7.7 |
| 44330.072916666664 | 7.7 |
| 44330.083333333336 | 7.7 |
| 44330.09375 | 7.7 |
| 44330.104166666664 | 7.7 |
| 44330.114583333336 | 7.69 |
| 44330.125 | 7.69 |
| 44330.135416666664 | 7.68 |
| 44330.145833333336 | 7.68 |
| 44330.15625 | 7.69 |
| 44330.166666666664 | 7.68 |
| 44330.177083333336 | 7.66 |
| 44330.1875 | 7.66 |
| 44330.197916666664 | 7.64 |
| 44330.208333333336 | 7.64 |
| 44330.21875 | 7.63 |
| 44330.229166666664 | 7.62 |
| 44330.239583333336 | 7.6 |
| 44330.25 | 7.6 |
| 44330.260416666664 | 7.63 |
| 44330.270833333336 | 7.63 |
| 44330.28125 | 7.63 |
| 44330.291666666664 | 7.64 |
| 44330.302083333336 | 7.63 |
| 44330.3125 | 7.63 |
| 44330.322916666664 | 7.63 |
| 44330.333333333336 | 7.63 |
| 44330.34375 | 7.62 |
| 44330.354166666664 | 7.62 |
| 44330.364583333336 | 7.61 |
| 44330.375 | 7.61 |
| 44330.385416666664 | 7.61 |
| 44330.395833333336 | 7.61 |
| 44330.40625 | 7.61 |
| 44330.416666666664 | 7.61 |
| 44330.427083333336 | 7.61 |
| 44330.4375 | 7.61 |
| 44330.447916666664 | 7.6 |
| 44330.458333333336 | 7.61 |
| 44330.46875 | 7.61 |
| 44330.479166666664 | 7.61 |
| 44330.489583333336 | 7.61 |
| 44330.5 | 7.6 |
| 44330.510416666664 | 7.6 |
| 44330.520833333336 | 7.6 |
| 44330.53125 | 7.6 |
| 44330.541666666664 | 7.6 |
| 44330.552083333336 | 7.6 |
| 44330.5625 | 7.6 |
| 44330.572916666664 | 7.6 |
| 44330.583333333336 | 7.6 |
| 44330.59375 | 7.6 |
| 44330.604166666664 | 7.6 |
| 44330.614583333336 | 7.6 |
| 44330.625 | 7.6 |
| 44330.635416666664 | 7.61 |
| 44330.645833333336 | 7.61 |
| 44330.65625 | 7.63 |
| 44330.666666666664 | 7.64 |
| 44330.677083333336 | 7.65 |
| 44330.6875 | 7.66 |
| 44330.697916666664 | 7.66 |
| 44330.708333333336 | 7.64 |
| 44330.71875 | 7.66 |
| 44330.729166666664 | 7.66 |
| 44330.739583333336 | 7.68 |
| 44330.75 | 7.69 |
| 44330.760416666664 | 7.71 |
| 44330.770833333336 | 7.71 |
| 44330.78125 | 7.71 |
| 44330.791666666664 | 7.71 |
| 44330.802083333336 | 7.71 |
| 44330.8125 | 7.71 |
| 44330.822916666664 | 7.7 |
| 44330.833333333336 | 7.7 |
| 44330.84375 | 7.69 |
| 44330.854166666664 | 7.69 |
| 44330.864583333336 | 7.68 |
| 44330.875 | 7.67 |
| 44330.885416666664 | 7.68 |
| 44330.895833333336 | 7.68 |
| 44330.90625 | 7.68 |
| 44330.916666666664 | 7.68 |
| 44330.927083333336 | 7.68 |
| 44330.9375 | 7.68 |
| 44330.947916666664 | 7.69 |
| 44330.958333333336 | 7.7 |
| 44330.96875 | 7.71 |
| 44330.979166666664 | 7.72 |
| 44330.989583333336 | 7.71 |
| 44331.0 | 7.71 |
| 44331.010416666664 | 7.7 |
| 44331.020833333336 | 7.69 |
| 44331.03125 | 7.69 |
| 44331.041666666664 | 7.69 |
| 44331.052083333336 | 7.69 |
| 44331.0625 | 7.69 |
| 44331.072916666664 | 7.68 |
| 44331.083333333336 | 7.69 |
| 44331.09375 | 7.68 |
| 44331.104166666664 | 7.68 |
| 44331.114583333336 | 7.68 |
| 44331.125 | 7.68 |
| 44331.135416666664 | 7.68 |
| 44331.145833333336 | 7.67 |
| 44331.15625 | 7.64 |
| 44331.166666666664 | 7.66 |
| 44331.177083333336 | 7.66 |
| 44331.1875 | 7.66 |
| 44331.197916666664 | 7.66 |
| 44331.208333333336 | 7.65 |
| 44331.21875 | 7.63 |
| 44331.229166666664 | 7.62 |
| 44331.239583333336 | 7.62 |
| 44331.25 | 7.6 |
| 44331.260416666664 | 7.59 |
| 44331.270833333336 | 7.61 |
| 44331.28125 | 7.62 |
| 44331.291666666664 | 7.63 |
| 44331.302083333336 | 7.63 |
| 44331.3125 | 7.63 |
| 44331.322916666664 | 7.63 |
| 44331.333333333336 | 7.62 |
| 44331.34375 | 7.61 |
| 44331.354166666664 | 7.6 |
| 44331.364583333336 | 7.6 |
| 44331.375 | 7.59 |
| 44331.385416666664 | 7.59 |
| 44331.395833333336 | 7.58 |
| 44331.40625 | 7.57 |
| 44331.416666666664 | 7.58 |
| 44331.427083333336 | 7.59 |
| 44331.4375 | 7.58 |
| 44331.447916666664 | 7.58 |
| 44331.458333333336 | 7.58 |
| 44331.46875 | 7.58 |
| 44331.479166666664 | 7.58 |
| 44331.489583333336 | 7.59 |
| 44331.5 | 7.59 |
| 44331.510416666664 | 7.59 |
| 44331.520833333336 | 7.59 |
| 44331.53125 | 7.59 |
| 44331.541666666664 | 7.59 |
| 44331.552083333336 | 7.59 |
| 44331.5625 | 7.59 |
| 44331.572916666664 | 7.59 |
| 44331.583333333336 | 7.59 |
| 44331.59375 | 7.59 |
| 44331.604166666664 | 7.59 |
| 44331.614583333336 | 7.59 |
| 44331.625 | 7.59 |
| 44331.635416666664 | 7.59 |
| 44331.645833333336 | 7.59 |
| 44331.65625 | 7.59 |
| 44331.666666666664 | 7.6 |
| 44331.677083333336 | 7.6 |
| 44331.6875 | 7.62 |
| 44331.697916666664 | 7.64 |
| 44331.708333333336 | 7.66 |
| 44331.71875 | 7.67 |
| 44331.729166666664 | 7.69 |
| 44331.739583333336 | 7.69 |
| 44331.75 | 7.67 |
| 44331.760416666664 | 7.68 |
| 44331.770833333336 | 7.69 |
| 44331.78125 | 7.7 |
| 44331.791666666664 | 7.72 |
| 44331.802083333336 | 7.73 |
| 44331.8125 | 7.74 |
| 44331.822916666664 | 7.74 |
| 44331.833333333336 | 7.74 |
| 44331.84375 | 7.74 |
| 44331.854166666664 | 7.74 |
| 44331.864583333336 | 7.73 |
| 44331.875 | 7.73 |
| 44331.885416666664 | 7.72 |
| 44331.895833333336 | 7.71 |
| 44331.90625 | 7.72 |
| 44331.916666666664 | 7.72 |
| 44331.927083333336 | 7.71 |
| 44331.9375 | 7.71 |
| 44331.947916666664 | 7.7 |
| 44331.958333333336 | 7.7 |
| 44331.96875 | 7.7 |
| 44331.979166666664 | 7.71 |
| 44331.989583333336 | 7.71 |
| 44332.0 | 7.71 |
| 44332.010416666664 | 7.7 |
| 44332.020833333336 | 7.7 |
| 44332.03125 | 7.68 |
| 44332.041666666664 | 7.68 |
| 44332.052083333336 | 7.67 |
| 44332.0625 | 7.67 |
| 44332.072916666664 | 7.67 |
| 44332.083333333336 | 7.68 |
| 44332.09375 | 7.67 |
| 44332.104166666664 | 7.67 |
| 44332.114583333336 | 7.67 |
| 44332.125 | 7.66 |
| 44332.135416666664 | 7.66 |
| 44332.145833333336 | 7.66 |
| 44332.15625 | 7.66 |
| 44332.166666666664 | 7.65 |
| 44332.177083333336 | 7.63 |
| 44332.1875 | 7.61 |
| 44332.197916666664 | 7.63 |
| 44332.208333333336 | 7.65 |
| 44332.21875 | 7.64 |
| 44332.229166666664 | 7.64 |
| 44332.239583333336 | 7.62 |
| 44332.25 | 7.62 |
| 44332.260416666664 | 7.6 |
| 44332.270833333336 | 7.6 |
| 44332.28125 | 7.59 |
| 44332.291666666664 | 7.59 |
| 44332.302083333336 | 7.63 |
| 44332.3125 | 7.62 |
| 44332.322916666664 | 7.64 |
| 44332.333333333336 | 7.64 |
| 44332.34375 | 7.64 |
| 44332.354166666664 | 7.64 |
| 44332.364583333336 | 7.64 |
| 44332.375 | 7.63 |
| 44332.385416666664 | 7.63 |
| 44332.395833333336 | 7.63 |
| 44332.40625 | 7.62 |
| 44332.416666666664 | 7.61 |
| 44332.427083333336 | 7.61 |
| 44332.4375 | 7.56 |
| 44332.447916666664 | 7.56 |
| 44332.458333333336 | 7.59 |
| 44332.46875 | 7.59 |
| 44332.479166666664 | 7.59 |
| 44332.489583333336 | 7.59 |
| 44332.5 | 7.59 |
| 44332.510416666664 | 7.59 |
| 44332.520833333336 | 7.59 |
| 44332.53125 | 7.59 |
| 44332.541666666664 | 7.59 |
| 44332.552083333336 | 7.59 |
| 44332.5625 | 7.58 |
| 44332.572916666664 | 7.59 |
| 44332.583333333336 | 7.59 |
| 44332.59375 | 7.59 |
| 44332.604166666664 | 7.58 |
| 44332.614583333336 | 7.59 |
| 44332.625 | 7.58 |
| 44332.635416666664 | 7.58 |
| 44332.645833333336 | 7.58 |
| 44332.65625 | 7.58 |
| 44332.666666666664 | 7.58 |
| 44332.677083333336 | 7.58 |
| 44332.6875 | 7.59 |
| 44332.697916666664 | 7.6 |
| 44332.708333333336 | 7.61 |
| 44332.71875 | 7.63 |
| 44332.729166666664 | 7.64 |
| 44332.739583333336 | 7.65 |
| 44332.75 | 7.66 |
| 44332.760416666664 | 7.65 |
| 44332.770833333336 | 7.65 |
| 44332.78125 | 7.67 |
| 44332.791666666664 | 7.68 |
| 44332.802083333336 | 7.71 |
| 44332.8125 | 7.72 |
| 44332.822916666664 | 7.73 |
| 44332.833333333336 | 7.74 |
| 44332.84375 | 7.74 |
| 44332.854166666664 | 7.74 |
| 44332.864583333336 | 7.74 |
| 44332.875 | 7.74 |
| 44332.885416666664 | 7.73 |
| 44332.895833333336 | 7.72 |
| 44332.90625 | 7.72 |
| 44332.916666666664 | 7.71 |
| 44332.927083333336 | 7.7 |
| 44332.9375 | 7.71 |
| 44332.947916666664 | 7.7 |
| 44332.958333333336 | 7.7 |
| 44332.96875 | 7.7 |
| 44332.979166666664 | 7.69 |
| 44332.989583333336 | 7.7 |
| 44333.0 | 7.69 |
| 44333.010416666664 | 7.69 |
| 44333.020833333336 | 7.68 |
| 44333.03125 | 7.68 |
| 44333.041666666664 | 7.67 |
| 44333.052083333336 | 7.66 |
| 44333.0625 | 7.65 |
| 44333.072916666664 | 7.64 |
| 44333.083333333336 | 7.64 |
| 44333.09375 | 7.63 |
| 44333.104166666664 | 7.63 |
| 44333.114583333336 | 7.63 |
| 44333.125 | 7.63 |
| 44333.135416666664 | 7.63 |
| 44333.145833333336 | 7.63 |
| 44333.15625 | 7.63 |
| 44333.166666666664 | 7.63 |
| 44333.177083333336 | 7.62 |
| 44333.1875 | 7.62 |
| 44333.197916666664 | 7.59 |
| 44333.208333333336 | 7.51 |
| 44333.21875 | 7.56 |
| 44333.229166666664 | 7.57 |
| 44333.239583333336 | 7.59 |
| 44333.25 | 7.63 |
| 44333.260416666664 | 7.62 |
| 44333.270833333336 | 7.58 |
| 44333.28125 | 7.57 |
| 44333.291666666664 | 7.58 |
| 44333.302083333336 | 7.55 |
| 44333.3125 | 7.55 |
| 44333.322916666664 | 7.55 |
| 44333.333333333336 | 7.55 |
| 44333.34375 | 7.58 |
| 44333.354166666664 | 7.59 |
| 44333.364583333336 | 7.6 |
| 44333.375 | 7.6 |
| 44333.385416666664 | 7.6 |
| 44333.395833333336 | 7.6 |
| 44333.40625 | 7.59 |
| 44333.416666666664 | 7.59 |
| 44333.427083333336 | 7.58 |
| 44333.4375 | 7.58 |
| 44333.447916666664 | 7.57 |
| 44333.458333333336 | 7.57 |
| 44333.46875 | 7.57 |
| 44333.479166666664 | 7.58 |
| 44333.489583333336 | 7.58 |
| 44333.5 | 7.57 |
| 44333.510416666664 | 7.57 |
| 44333.520833333336 | 7.56 |
| 44333.53125 | 7.56 |
| 44333.541666666664 | 7.56 |
| 44333.552083333336 | 7.57 |
| 44333.5625 | 7.56 |
| 44333.572916666664 | 7.57 |
| 44333.583333333336 | 7.57 |
| 44333.59375 | 7.57 |
| 44333.604166666664 | 7.58 |
| 44333.614583333336 | 7.58 |
| 44333.625 | 7.58 |
| 44333.635416666664 | 7.59 |
| 44333.645833333336 | 7.59 |
| 44333.65625 | 7.59 |
| 44333.666666666664 | 7.59 |
| 44333.677083333336 | 7.59 |
| 44333.6875 | 7.59 |
| 44333.697916666664 | 7.59 |
| 44333.708333333336 | 7.6 |
| 44333.71875 | 7.59 |
| 44333.729166666664 | 7.61 |
| 44333.739583333336 | 7.63 |
| 44333.75 | 7.64 |
| 44333.760416666664 | 7.66 |
| 44333.770833333336 | 7.67 |
| 44333.78125 | 7.66 |
| 44333.791666666664 | 7.66 |
| 44333.802083333336 | 7.65 |
| 44333.8125 | 7.68 |
| 44333.822916666664 | 7.69 |
| 44333.833333333336 | 7.7 |
| 44333.84375 | 7.71 |
| 44333.854166666664 | 7.72 |
| 44333.864583333336 | 7.73 |
| 44333.875 | 7.73 |
| 44333.885416666664 | 7.74 |
| 44333.895833333336 | 7.73 |
| 44333.90625 | 7.72 |
| 44333.916666666664 | 7.72 |
| 44333.927083333336 | 7.71 |
| 44333.9375 | 7.71 |
| 44333.947916666664 | 7.7 |
| 44333.958333333336 | 7.67 |
| 44333.96875 | 7.6 |
| 44333.979166666664 | 7.66 |
| 44333.989583333336 | 7.67 |
| 44334.0 | 7.68 |
| 44334.010416666664 | 7.67 |
| 44334.020833333336 | 7.68 |
| 44334.03125 | 7.68 |
| 44334.041666666664 | 7.68 |
| 44334.052083333336 | 7.68 |
| 44334.0625 | 7.67 |
| 44334.072916666664 | 7.67 |
| 44334.083333333336 | 7.66 |
| 44334.09375 | 7.65 |
| 44334.104166666664 | 7.65 |
| 44334.114583333336 | 7.64 |
| 44334.125 | 7.63 |
| 44334.135416666664 | 7.62 |
| 44334.145833333336 | 7.62 |
| 44334.15625 | 7.62 |
| 44334.166666666664 | 7.61 |
| 44334.177083333336 | 7.62 |
| 44334.1875 | 7.62 |
| 44334.197916666664 | 7.62 |
| 44334.208333333336 | 7.62 |
| 44334.21875 | 7.61 |
| 44334.229166666664 | 7.56 |
| 44334.239583333336 | 7.53 |
| 44334.25 | 7.52 |
| 44334.260416666664 | 7.55 |
| 44334.270833333336 | 7.55 |
| 44334.28125 | 7.61 |
| 44334.291666666664 | 7.6 |
| 44334.302083333336 | 7.61 |
| 44334.3125 | 7.57 |
| 44334.322916666664 | 7.56 |
| 44334.333333333336 | 7.56 |
| 44334.34375 | 7.56 |
| 44334.354166666664 | 7.58 |
| 44334.364583333336 | 7.57 |
| 44334.375 | 7.58 |
| 44334.385416666664 | 7.59 |
| 44334.395833333336 | 7.59 |
| 44334.40625 | 7.59 |
| 44334.416666666664 | 7.58 |
| 44334.427083333336 | 7.58 |
| 44334.4375 | 7.58 |
| 44334.447916666664 | 7.58 |
| 44334.458333333336 | 7.57 |
| 44334.46875 | 7.57 |
| 44334.479166666664 | 7.57 |
| 44334.489583333336 | 7.56 |
| 44334.5 | 7.55 |
| 44334.510416666664 | 7.5 |
| 44334.520833333336 | 7.51 |
| 44334.53125 | 7.54 |
| 44334.541666666664 | 7.55 |
| 44334.552083333336 | 7.52 |
| 44334.5625 | 7.54 |
| 44334.572916666664 | 7.55 |
| 44334.583333333336 | 7.56 |
| 44334.59375 | 7.56 |
| 44334.604166666664 | 7.57 |
| 44334.614583333336 | 7.58 |
| 44334.625 | 7.58 |
| 44334.635416666664 | 7.6 |
| 44334.645833333336 | 7.6 |
| 44334.65625 | 7.61 |
| 44334.666666666664 | 7.61 |
| 44334.677083333336 | 7.61 |
| 44334.6875 | 7.61 |
| 44334.697916666664 | 7.62 |
| 44334.708333333336 | 7.62 |
| 44334.71875 | 7.63 |
| 44334.729166666664 | 7.63 |
| 44334.739583333336 | 7.63 |
| 44334.75 | 7.64 |
| 44334.760416666664 | 7.64 |
| 44334.770833333336 | 7.64 |
| 44334.78125 | 7.67 |
| 44334.791666666664 | 7.69 |
| 44334.802083333336 | 7.7 |
| 44334.8125 | 7.7 |
| 44334.822916666664 | 7.72 |
| 44334.833333333336 | 7.71 |
| 44334.84375 | 7.71 |
| 44334.854166666664 | 7.71 |
| 44334.864583333336 | 7.73 |
| 44334.875 | 7.74 |
| 44334.885416666664 | 7.75 |
| 44334.895833333336 | 7.75 |
| 44334.90625 | 7.76 |
| 44334.916666666664 | 7.76 |
| 44334.927083333336 | 7.76 |
| 44334.9375 | 7.76 |
| 44334.947916666664 | 7.75 |
| 44334.958333333336 | 7.75 |
| 44334.96875 | 7.74 |
| 44334.979166666664 | 7.74 |
| 44334.989583333336 | 7.74 |
| 44335.0 | 7.74 |
| 44335.010416666664 | 7.73 |
| 44335.020833333336 | 7.72 |
| 44335.03125 | 7.72 |
| 44335.041666666664 | 7.71 |
| 44335.052083333336 | 7.71 |
| 44335.0625 | 7.71 |
| 44335.072916666664 | 7.7 |
| 44335.083333333336 | 7.7 |
| 44335.09375 | 7.69 |
| 44335.104166666664 | 7.68 |
| 44335.114583333336 | 7.67 |
| 44335.125 | 7.66 |
| 44335.135416666664 | 7.65 |
| 44335.145833333336 | 7.65 |
| 44335.15625 | 7.64 |
| 44335.166666666664 | 7.63 |
| 44335.177083333336 | 7.63 |
| 44335.1875 | 7.63 |
| 44335.197916666664 | 7.63 |
| 44335.208333333336 | 7.63 |
| 44335.21875 | 7.63 |
| 44335.229166666664 | 7.64 |
| 44335.239583333336 | 7.64 |
| 44335.25 | 7.64 |
| 44335.260416666664 | 7.65 |
| 44335.270833333336 | 7.61 |
| 44335.28125 | 7.61 |
| 44335.291666666664 | 7.61 |
| 44335.302083333336 | 7.62 |
| 44335.3125 | 7.63 |
| 44335.322916666664 | 7.65 |
| 44335.333333333336 | 7.62 |
| 44335.34375 | 7.6 |
| 44335.354166666664 | 7.61 |
| 44335.364583333336 | 7.6 |
| 44335.375 | 7.59 |
| 44335.385416666664 | 7.59 |
| 44335.395833333336 | 7.6 |
| 44335.40625 | 7.6 |
| 44335.416666666664 | 7.6 |
| 44335.427083333336 | 7.6 |
| 44335.4375 | 7.59 |
| 44335.447916666664 | 7.58 |
| 44335.458333333336 | 7.58 |
| 44335.46875 | 7.58 |
| 44335.479166666664 | 7.58 |
| 44335.489583333336 | 7.58 |
| 44335.5 | 7.58 |
| 44335.510416666664 | 7.58 |
| 44335.520833333336 | 7.58 |
| 44335.53125 | 7.58 |
| 44335.541666666664 | 7.58 |
| 44335.552083333336 | 7.58 |
| 44335.5625 | 7.57 |
| 44335.572916666664 | 7.57 |
| 44335.583333333336 | 7.56 |
| 44335.59375 | 7.56 |
| 44335.604166666664 | 7.56 |
| 44335.614583333336 | 7.57 |
| 44335.625 | 7.57 |
| 44335.635416666664 | 7.58 |
| 44335.645833333336 | 7.59 |
| 44335.65625 | 7.6 |
| 44335.666666666664 | 7.61 |
| 44335.677083333336 | 7.62 |
| 44335.6875 | 7.63 |
| 44335.697916666664 | 7.64 |
| 44335.708333333336 | 7.64 |
| 44335.71875 | 7.65 |
| 44335.729166666664 | 7.65 |
| 44335.739583333336 | 7.65 |
| 44335.75 | 7.65 |
| 44335.760416666664 | 7.65 |
| 44335.770833333336 | 7.64 |
| 44335.78125 | 7.64 |
| 44335.791666666664 | 7.64 |
| 44335.802083333336 | 7.65 |
| 44335.8125 | 7.65 |
| 44335.822916666664 | 7.66 |
| 44335.833333333336 | 7.66 |
| 44335.84375 | 7.68 |
| 44335.854166666664 | 7.69 |
| 44335.864583333336 | 7.7 |
| 44335.875 | 7.69 |
| 44335.885416666664 | 7.69 |
| 44335.895833333336 | 7.69 |
| 44335.90625 | 7.7 |
| 44335.916666666664 | 7.7 |
| 44335.927083333336 | 7.71 |
| 44335.9375 | 7.71 |
| 44335.947916666664 | 7.71 |
| 44335.958333333336 | 7.71 |
| 44335.96875 | 7.71 |
| 44335.979166666664 | 7.71 |
| 44335.989583333336 | 7.71 |
| 44336.0 | 7.72 |
| 44336.010416666664 | 7.71 |
| 44336.020833333336 | 7.71 |
| 44336.03125 | 7.71 |
| 44336.041666666664 | 7.71 |
| 44336.052083333336 | 7.7 |
| 44336.0625 | 7.69 |
| 44336.072916666664 | 7.68 |
| 44336.083333333336 | 7.68 |
| 44336.09375 | 7.67 |
| 44336.104166666664 | 7.66 |
| 44336.114583333336 | 7.66 |
| 44336.125 | 7.65 |
| 44336.135416666664 | 7.65 |
| 44336.145833333336 | 7.64 |
| 44336.15625 | 7.63 |
| 44336.166666666664 | 7.62 |
| 44336.177083333336 | 7.61 |
| 44336.1875 | 7.6 |
| 44336.197916666664 | 7.59 |
| 44336.208333333336 | 7.58 |
| 44336.21875 | 7.58 |
| 44336.229166666664 | 7.57 |
| 44336.239583333336 | 7.56 |
| 44336.25 | 7.56 |
| 44336.260416666664 | 7.57 |
| 44336.270833333336 | 7.58 |
| 44336.28125 | 7.58 |
| 44336.291666666664 | 7.59 |
| 44336.302083333336 | 7.6 |
| 44336.3125 | 7.61 |
| 44336.322916666664 | 7.56 |
| 44336.333333333336 | 7.59 |
| 44336.34375 | 7.6 |
| 44336.354166666664 | 7.59 |
| 44336.364583333336 | 7.59 |
| 44336.375 | 7.57 |
| 44336.385416666664 | 7.54 |
| 44336.395833333336 | 7.53 |
| 44336.40625 | 7.52 |
| 44336.416666666664 | 7.51 |
| 44336.427083333336 | 7.5 |
| 44336.4375 | 7.53 |
| 44336.447916666664 | 7.53 |
| 44336.458333333336 | 7.53 |
| 44336.46875 | 7.54 |
| 44336.479166666664 | 7.54 |
| 44336.489583333336 | 7.54 |
| 44336.5 | 7.54 |
| 44336.510416666664 | 7.54 |
| 44336.520833333336 | 7.54 |
| 44336.53125 | 7.54 |
| 44336.541666666664 | 7.54 |
| 44336.552083333336 | 7.54 |
| 44336.5625 | 7.55 |
| 44336.572916666664 | 7.55 |
| 44336.583333333336 | 7.56 |
| 44336.59375 | 7.55 |
| 44336.604166666664 | 7.54 |
| 44336.614583333336 | 7.54 |
| 44336.625 | 7.53 |
| 44336.635416666664 | 7.54 |
| 44336.645833333336 | 7.53 |
| 44336.65625 | 7.53 |
| 44336.666666666664 | 7.54 |
| 44336.677083333336 | 7.55 |
| 44336.6875 | 7.56 |
| 44336.697916666664 | 7.58 |
| 44336.708333333336 | 7.59 |
| 44336.71875 | 7.6 |
| 44336.729166666664 | 7.61 |
| 44336.739583333336 | 7.61 |
| 44336.75 | 7.62 |
| 44336.760416666664 | 7.62 |
| 44336.770833333336 | 7.63 |
| 44336.78125 | 7.63 |
| 44336.791666666664 | 7.62 |
| 44336.802083333336 | 7.62 |
| 44336.8125 | 7.62 |
| 44336.822916666664 | 7.63 |
| 44336.833333333336 | 7.63 |
| 44336.84375 | 7.64 |
| 44336.854166666664 | 7.65 |
| 44336.864583333336 | 7.67 |
| 44336.875 | 7.68 |
| 44336.885416666664 | 7.69 |
| 44336.895833333336 | 7.71 |
| 44336.90625 | 7.71 |
| 44336.916666666664 | 7.7 |
| 44336.927083333336 | 7.71 |
| 44336.9375 | 7.71 |
| 44336.947916666664 | 7.72 |
| 44336.958333333336 | 7.73 |
| 44336.96875 | 7.75 |
| 44336.979166666664 | 7.76 |
| 44336.989583333336 | 7.76 |
| 44337.0 | 7.75 |
| 44337.010416666664 | 7.74 |
| 44337.020833333336 | 7.73 |
| 44337.03125 | 7.72 |
| 44337.041666666664 | 7.71 |
| 44337.052083333336 | 7.71 |
| 44337.0625 | 7.71 |
| 44337.072916666664 | 7.71 |
| 44337.083333333336 | 7.71 |
| 44337.09375 | 7.71 |
| 44337.104166666664 | 7.71 |
| 44337.114583333336 | 7.69 |
| 44337.125 | 7.69 |
| 44337.135416666664 | 7.68 |
| 44337.145833333336 | 7.68 |
| 44337.15625 | 7.68 |
| 44337.166666666664 | 7.68 |
| 44337.177083333336 | 7.68 |
| 44337.1875 | 7.68 |
| 44337.197916666664 | 7.67 |
| 44337.208333333336 | 7.66 |
| 44337.21875 | 7.66 |
| 44337.229166666664 | 7.66 |
| 44337.239583333336 | 7.65 |
| 44337.25 | 7.64 |
| 44337.260416666664 | 7.63 |
| 44337.270833333336 | 7.63 |
| 44337.28125 | 7.62 |
| 44337.291666666664 | 7.62 |
| 44337.302083333336 | 7.62 |
| 44337.3125 | 7.62 |
| 44337.322916666664 | 7.62 |
| 44337.333333333336 | 7.63 |
| 44337.34375 | 7.62 |
| 44337.354166666664 | 7.63 |
| 44337.364583333336 | 7.61 |
| 44337.375 | 7.61 |
| 44337.385416666664 | 7.62 |
| 44337.395833333336 | 7.62 |
| 44337.40625 | 7.63 |
| 44337.416666666664 | 7.61 |
| 44337.427083333336 | 7.59 |
| 44337.4375 | 7.58 |
| 44337.447916666664 | 7.57 |
| 44337.458333333336 | 7.56 |
| 44337.46875 | 7.55 |
| 44337.479166666664 | 7.56 |
| 44337.489583333336 | 7.56 |
| 44337.5 | 7.56 |
| 44337.510416666664 | 7.55 |
| 44337.520833333336 | 7.56 |
| 44337.53125 | 7.56 |
| 44337.541666666664 | 7.56 |
| 44337.552083333336 | 7.56 |
| 44337.5625 | 7.57 |
| 44337.572916666664 | 7.57 |
| 44337.583333333336 | 7.58 |
| 44337.59375 | 7.59 |
| 44337.604166666664 | 7.59 |
| 44337.614583333336 | 7.6 |
| 44337.625 | 7.6 |
| 44337.635416666664 | 7.6 |
| 44337.645833333336 | 7.6 |
| 44337.65625 | 7.59 |
| 44337.666666666664 | 7.58 |
| 44337.677083333336 | 7.58 |
| 44337.6875 | 7.59 |
| 44337.697916666664 | 7.59 |
| 44337.708333333336 | 7.6 |
| 44337.71875 | 7.62 |
| 44337.729166666664 | 7.64 |
| 44337.739583333336 | 7.67 |
| 44337.75 | 7.67 |
| 44337.760416666664 | 7.68 |
| 44337.770833333336 | 7.69 |
| 44337.78125 | 7.69 |
| 44337.791666666664 | 7.69 |
| 44337.802083333336 | 7.69 |
| 44337.8125 | 7.69 |
| 44337.822916666664 | 7.68 |
| 44337.833333333336 | 7.68 |
| 44337.84375 | 7.67 |
| 44337.854166666664 | 7.68 |
| 44337.864583333336 | 7.68 |
| 44337.875 | 7.67 |
| 44337.885416666664 | 7.69 |
| 44337.895833333336 | 7.7 |
| 44337.90625 | 7.7 |
| 44337.916666666664 | 7.71 |
| 44337.927083333336 | 7.71 |
| 44337.9375 | 7.7 |
| 44337.947916666664 | 7.7 |
| 44337.958333333336 | 7.7 |
| 44337.96875 | 7.7 |
| 44337.979166666664 | 7.69 |
| 44337.989583333336 | 7.7 |
| 44338.0 | 7.71 |
| 44338.010416666664 | 7.71 |
| 44338.020833333336 | 7.73 |
| 44338.03125 | 7.75 |
| 44338.041666666664 | 7.74 |
| 44338.052083333336 | 7.72 |
| 44338.0625 | 7.73 |
| 44338.072916666664 | 7.72 |
| 44338.083333333336 | 7.7 |
| 44338.09375 | 7.71 |
| 44338.104166666664 | 7.7 |
| 44338.114583333336 | 7.71 |
| 44338.125 | 7.71 |
| 44338.135416666664 | 7.71 |
| 44338.145833333336 | 7.71 |
| 44338.15625 | 7.69 |
| 44338.166666666664 | 7.69 |
| 44338.177083333336 | 7.69 |
| 44338.1875 | 7.68 |
| 44338.197916666664 | 7.68 |
| 44338.208333333336 | 7.67 |
| 44338.21875 | 7.67 |
| 44338.229166666664 | 7.67 |
| 44338.239583333336 | 7.66 |
| 44338.25 | 7.65 |
| 44338.260416666664 | 7.64 |
| 44338.270833333336 | 7.64 |
| 44338.28125 | 7.63 |
| 44338.291666666664 | 7.62 |
| 44338.302083333336 | 7.61 |
| 44338.3125 | 7.61 |
| 44338.322916666664 | 7.6 |
| 44338.333333333336 | 7.59 |
| 44338.34375 | 7.59 |
| 44338.354166666664 | 7.59 |
| 44338.364583333336 | 7.59 |
| 44338.375 | 7.59 |
| 44338.385416666664 | 7.59 |
| 44338.395833333336 | 7.58 |
| 44338.40625 | 7.57 |
| 44338.416666666664 | 7.56 |
| 44338.427083333336 | 7.57 |
| 44338.4375 | 7.57 |
| 44338.447916666664 | 7.58 |
| 44338.458333333336 | 7.56 |
| 44338.46875 | 7.57 |
| 44338.479166666664 | 7.54 |
| 44338.489583333336 | 7.54 |
| 44338.5 | 7.53 |
| 44338.510416666664 | 7.53 |
| 44338.520833333336 | 7.54 |
| 44338.53125 | 7.55 |
| 44338.541666666664 | 7.55 |
| 44338.552083333336 | 7.56 |
| 44338.5625 | 7.57 |
| 44338.572916666664 | 7.57 |
| 44338.583333333336 | 7.58 |
| 44338.59375 | 7.59 |
| 44338.604166666664 | 7.59 |
| 44338.614583333336 | 7.59 |
| 44338.625 | 7.6 |
| 44338.635416666664 | 7.6 |
| 44338.645833333336 | 7.61 |
| 44338.65625 | 7.6 |
| 44338.666666666664 | 7.6 |
| 44338.677083333336 | 7.6 |
| 44338.6875 | 7.6 |
| 44338.697916666664 | 7.59 |
| 44338.708333333336 | 7.59 |
| 44338.71875 | 7.59 |
| 44338.729166666664 | 7.6 |
| 44338.739583333336 | 7.61 |
| 44338.75 | 7.62 |
| 44338.760416666664 | 7.63 |
| 44338.770833333336 | 7.65 |
| 44338.78125 | 7.67 |
| 44338.791666666664 | 7.68 |
| 44338.802083333336 | 7.68 |
| 44338.8125 | 7.67 |
| 44338.822916666664 | 7.66 |
| 44338.833333333336 | 7.65 |
| 44338.84375 | 7.66 |
| 44338.854166666664 | 7.66 |
| 44338.864583333336 | 7.66 |
| 44338.875 | 7.65 |
| 44338.885416666664 | 7.65 |
| 44338.895833333336 | 7.65 |
| 44338.90625 | 7.65 |
| 44338.916666666664 | 7.65 |
| 44338.927083333336 | 7.65 |
| 44338.9375 | 7.65 |
| 44338.947916666664 | 7.65 |
| 44338.958333333336 | 7.63 |
| 44338.96875 | 7.65 |
| 44338.979166666664 | 7.65 |
| 44338.989583333336 | 7.66 |
| 44339.0 | 7.65 |
| 44339.010416666664 | 7.64 |
| 44339.020833333336 | 7.63 |
| 44339.03125 | 7.62 |
| 44339.041666666664 | 7.62 |
| 44339.052083333336 | 7.6 |
| 44339.0625 | 7.62 |
| 44339.072916666664 | 7.64 |
| 44339.083333333336 | 7.63 |
| 44339.09375 | 7.65 |
| 44339.104166666664 | 7.64 |
| 44339.114583333336 | 7.65 |
| 44339.125 | 7.64 |
| 44339.135416666664 | 7.65 |
| 44339.145833333336 | 7.65 |
| 44339.15625 | 7.67 |
| 44339.166666666664 | 7.66 |
| 44339.177083333336 | 7.67 |
| 44339.1875 | 7.66 |
| 44339.197916666664 | 7.63 |
| 44339.208333333336 | 7.64 |
| 44339.21875 | 7.63 |
| 44339.229166666664 | 7.62 |
| 44339.239583333336 | 7.62 |
| 44339.25 | 7.61 |
| 44339.260416666664 | 7.61 |
| 44339.270833333336 | 7.6 |
| 44339.28125 | 7.59 |
| 44339.291666666664 | 7.59 |
| 44339.302083333336 | 7.58 |
| 44339.3125 | 7.57 |
| 44339.322916666664 | 7.57 |
| 44339.333333333336 | 7.56 |
| 44339.34375 | 7.56 |
| 44339.354166666664 | 7.55 |
| 44339.364583333336 | 7.55 |
| 44339.375 | 7.55 |
| 44339.385416666664 | 7.56 |
| 44339.395833333336 | 7.56 |
| 44339.40625 | 7.57 |
| 44339.416666666664 | 7.57 |
| 44339.427083333336 | 7.57 |
| 44339.4375 | 7.55 |
| 44339.447916666664 | 7.53 |
| 44339.458333333336 | 7.57 |
| 44339.46875 | 7.55 |
| 44339.479166666664 | 7.54 |
| 44339.489583333336 | 7.53 |
| 44339.5 | 7.51 |
| 44339.510416666664 | 7.5 |
| 44339.520833333336 | 7.5 |
| 44339.53125 | 7.48 |
| 44339.541666666664 | 7.47 |
| 44339.552083333336 | 7.46 |
| 44339.5625 | 7.47 |
| 44339.572916666664 | 7.48 |
| 44339.583333333336 | 7.49 |
| 44339.59375 | 7.5 |
| 44339.604166666664 | 7.51 |
| 44339.614583333336 | 7.52 |
| 44339.625 | 7.53 |
| 44339.635416666664 | 7.54 |
| 44339.645833333336 | 7.55 |
| 44339.65625 | 7.55 |
| 44339.666666666664 | 7.56 |
| 44339.677083333336 | 7.56 |
| 44339.6875 | 7.57 |
| 44339.697916666664 | 7.56 |
| 44339.708333333336 | 7.57 |
| 44339.71875 | 7.57 |
| 44339.729166666664 | 7.56 |
| 44339.739583333336 | 7.56 |
| 44339.75 | 7.56 |
| 44339.760416666664 | 7.57 |
| 44339.770833333336 | 7.55 |
| 44339.78125 | 7.57 |
| 44339.791666666664 | 7.62 |
| 44339.802083333336 | 7.64 |
| 44339.8125 | 7.66 |
| 44339.822916666664 | 7.67 |
| 44339.833333333336 | 7.67 |
| 44339.84375 | 7.66 |
| 44339.854166666664 | 7.65 |
| 44339.864583333336 | 7.64 |
| 44339.875 | 7.65 |
| 44339.885416666664 | 7.65 |
| 44339.895833333336 | 7.65 |
| 44339.90625 | 7.64 |
| 44339.916666666664 | 7.64 |
| 44339.927083333336 | 7.64 |
| 44339.9375 | 7.64 |
| 44339.947916666664 | 7.64 |
| 44339.958333333336 | 7.64 |
| 44339.96875 | 7.64 |
| 44339.979166666664 | 7.64 |
| 44339.989583333336 | 7.63 |
| 44340.0 | 7.62 |
| 44340.010416666664 | 7.64 |
| 44340.020833333336 | 7.64 |
| 44340.03125 | 7.63 |
| 44340.041666666664 | 7.63 |
| 44340.052083333336 | 7.62 |
| 44340.0625 | 7.58 |
| 44340.072916666664 | 7.55 |
| 44340.083333333336 | 7.52 |
| 44340.09375 | 7.52 |
| 44340.104166666664 | 7.49 |
| 44340.114583333336 | 7.51 |
| 44340.125 | 7.55 |
| 44340.135416666664 | 7.53 |
| 44340.145833333336 | 7.54 |
| 44340.15625 | 7.58 |
| 44340.166666666664 | 7.58 |
| 44340.177083333336 | 7.57 |
| 44340.1875 | 7.57 |
| 44340.197916666664 | 7.58 |
| 44340.208333333336 | 7.57 |
| 44340.21875 | 7.56 |
| 44340.229166666664 | 7.57 |
| 44340.239583333336 | 7.55 |
| 44340.25 | 7.54 |
| 44340.260416666664 | 7.55 |
| 44340.270833333336 | 7.55 |
| 44340.28125 | 7.55 |
| 44340.291666666664 | 7.55 |
| 44340.302083333336 | 7.54 |
| 44340.3125 | 7.54 |
| 44340.322916666664 | 7.53 |
| 44340.333333333336 | 7.53 |
| 44340.34375 | 7.53 |
| 44340.354166666664 | 7.53 |
| 44340.364583333336 | 7.53 |
| 44340.375 | 7.53 |
| 44340.385416666664 | 7.53 |
| 44340.395833333336 | 7.54 |
| 44340.40625 | 7.54 |
| 44340.416666666664 | 7.55 |
| 44340.427083333336 | 7.57 |
| 44340.4375 | 7.59 |
| 44340.447916666664 | 7.6 |
| 44340.458333333336 | 7.61 |
| 44340.46875 | 7.56 |
| 44340.479166666664 | 7.55 |
| 44340.489583333336 | 7.62 |
| 44340.5 | 7.57 |
| 44340.510416666664 | 7.61 |
| 44340.520833333336 | 7.6 |
| 44340.53125 | 7.59 |
| 44340.541666666664 | 7.59 |
| 44340.552083333336 | 7.58 |
| 44340.5625 | 7.57 |
| 44340.572916666664 | 7.58 |
| 44340.583333333336 | 7.59 |
| 44340.59375 | 7.59 |
| 44340.604166666664 | 7.6 |
| 44340.614583333336 | 7.58 |
| 44340.625 | 7.59 |
| 44340.635416666664 | 7.59 |
| 44340.645833333336 | 7.59 |
| 44340.65625 | 7.59 |
| 44340.666666666664 | 7.59 |
| 44340.677083333336 | 7.58 |
| 44340.6875 | 7.58 |
| 44340.697916666664 | 7.58 |
| 44340.708333333336 | 7.58 |
| 44340.71875 | 7.58 |
| 44340.729166666664 | 7.58 |
| 44340.739583333336 | 7.58 |
| 44340.75 | 7.58 |
| 44340.760416666664 | 7.57 |
| 44340.770833333336 | 7.57 |
| 44340.78125 | 7.58 |
| 44340.791666666664 | 7.58 |
| 44340.802083333336 | 7.58 |
| 44340.8125 | 7.6 |
| 44340.822916666664 | 7.61 |
| 44340.833333333336 | 7.62 |
| 44340.84375 | 7.63 |
| 44340.854166666664 | 7.64 |
| 44340.864583333336 | 7.65 |
| 44340.875 | 7.67 |
| 44340.885416666664 | 7.67 |
| 44340.895833333336 | 7.67 |
| 44340.90625 | 7.67 |
| 44340.916666666664 | 7.68 |
| 44340.927083333336 | 7.69 |
| 44340.9375 | 7.69 |
| 44340.947916666664 | 7.7 |
| 44340.958333333336 | 7.69 |
| 44340.96875 | 7.69 |
| 44340.979166666664 | 7.69 |
| 44340.989583333336 | 7.69 |
| 44341.0 | 7.69 |
| 44341.010416666664 | 7.69 |
| 44341.020833333336 | 7.69 |
| 44341.03125 | 7.69 |
| 44341.041666666664 | 7.68 |
| 44341.052083333336 | 7.68 |
| 44341.0625 | 7.68 |
| 44341.072916666664 | 7.68 |
| 44341.083333333336 | 7.68 |
| 44341.09375 | 7.66 |
| 44341.104166666664 | 7.65 |
| 44341.114583333336 | 7.63 |
| 44341.125 | 7.62 |
| 44341.135416666664 | 7.62 |
| 44341.145833333336 | 7.6 |
| 44341.15625 | 7.58 |
| 44341.166666666664 | 7.57 |
| 44341.177083333336 | 7.57 |
| 44341.1875 | 7.56 |
| 44341.197916666664 | 7.56 |
| 44341.208333333336 | 7.55 |
| 44341.21875 | 7.55 |
| 44341.229166666664 | 7.53 |
| 44341.239583333336 | 7.51 |
| 44341.25 | 7.49 |
| 44341.260416666664 | 7.47 |
| 44341.270833333336 | 7.46 |
| 44341.28125 | 7.47 |
| 44341.291666666664 | 7.48 |
| 44341.302083333336 | 7.47 |
| 44341.3125 | 7.48 |
| 44341.322916666664 | 7.5 |
| 44341.333333333336 | 7.52 |
| 44341.34375 | 7.53 |
| 44341.354166666664 | 7.53 |
| 44341.364583333336 | 7.55 |
| 44341.375 | 7.55 |
| 44341.385416666664 | 7.56 |
| 44341.395833333336 | 7.57 |
| 44341.40625 | 7.59 |
| 44341.416666666664 | 7.6 |
| 44341.427083333336 | 7.6 |
| 44341.4375 | 7.61 |
| 44341.447916666664 | 7.62 |
| 44341.458333333336 | 7.63 |
| 44341.46875 | 7.64 |
| 44341.479166666664 | 7.66 |
| 44341.489583333336 | 7.66 |
| 44341.5 | 7.66 |
| 44341.510416666664 | 7.67 |
| 44341.520833333336 | 7.67 |
| 44341.53125 | 7.68 |
| 44341.541666666664 | 7.67 |
| 44341.552083333336 | 7.66 |
| 44341.5625 | 7.67 |
| 44341.572916666664 | 7.66 |
| 44341.583333333336 | 7.64 |
| 44341.59375 | 7.63 |
| 44341.604166666664 | 7.62 |
| 44341.614583333336 | 7.59 |
| 44341.625 | 7.58 |
| 44341.635416666664 | 7.58 |
| 44341.645833333336 | 7.58 |
| 44341.65625 | 7.58 |
| 44341.666666666664 | 7.59 |
| 44341.677083333336 | 7.59 |
| 44341.6875 | 7.59 |
| 44341.697916666664 | 7.58 |
| 44341.708333333336 | 7.57 |
| 44341.71875 | 7.56 |
| 44341.729166666664 | 7.53 |
| 44341.739583333336 | 7.51 |
| 44341.75 | 7.5 |
| 44341.760416666664 | 7.5 |
| 44341.770833333336 | 7.49 |
| 44341.78125 | 7.5 |
| 44341.791666666664 | 7.52 |
| 44341.802083333336 | 7.49 |
| 44341.8125 | 7.5 |
| 44341.822916666664 | 7.53 |
| 44341.833333333336 | 7.58 |
| 44341.84375 | 7.59 |
| 44341.854166666664 | 7.61 |
| 44341.864583333336 | 7.63 |
| 44341.875 | 7.66 |
| 44341.885416666664 | 7.66 |
| 44341.895833333336 | 7.66 |
| 44341.90625 | 7.66 |
| 44341.916666666664 | 7.65 |
| 44341.927083333336 | 7.65 |
| 44341.9375 | 7.66 |
| 44341.947916666664 | 7.66 |
| 44341.958333333336 | 7.67 |
| 44341.96875 | 7.67 |
| 44341.979166666664 | 7.67 |
| 44341.989583333336 | 7.66 |
| 44342.0 | 7.66 |
| 44342.010416666664 | 7.65 |
| 44342.020833333336 | 7.65 |
| 44342.03125 | 7.65 |
| 44342.041666666664 | 7.66 |
| 44342.052083333336 | 7.64 |
| 44342.0625 | 7.64 |
| 44342.072916666664 | 7.64 |
| 44342.083333333336 | 7.65 |
| 44342.09375 | 7.63 |
| 44342.104166666664 | 7.62 |
| 44342.114583333336 | 7.61 |
| 44342.125 | 7.59 |
| 44342.135416666664 | 7.57 |
| 44342.145833333336 | 7.56 |
| 44342.15625 | 7.54 |
| 44342.166666666664 | 7.51 |
| 44342.177083333336 | 7.53 |
| 44342.1875 | 7.51 |
| 44342.197916666664 | 7.5 |
| 44342.208333333336 | 7.54 |
| 44342.21875 | 7.53 |
| 44342.229166666664 | 7.52 |
| 44342.239583333336 | 7.51 |
| 44342.25 | 7.49 |
| 44342.260416666664 | 7.48 |
| 44342.270833333336 | 7.44 |
| 44342.28125 | 7.42 |
| 44342.291666666664 | 7.39 |
| 44342.302083333336 | 7.38 |
| 44342.3125 | 7.37 |
| 44342.322916666664 | 7.39 |
| 44342.333333333336 | 7.41 |
| 44342.34375 | 7.39 |
| 44342.354166666664 | 7.39 |
| 44342.364583333336 | 7.41 |
| 44342.375 | 7.44 |
| 44342.385416666664 | 7.46 |
| 44342.395833333336 | 7.48 |
| 44342.40625 | 7.49 |
| 44342.416666666664 | 7.5 |
| 44342.427083333336 | 7.52 |
| 44342.4375 | 7.53 |
| 44342.447916666664 | 7.53 |
| 44342.458333333336 | 7.55 |
| 44342.46875 | 7.55 |
| 44342.479166666664 | 7.56 |
| 44342.489583333336 | 7.56 |
| 44342.5 | 7.57 |
| 44342.510416666664 | 7.58 |
| 44342.520833333336 | 7.59 |
| 44342.53125 | 7.6 |
| 44342.541666666664 | 7.6 |
| 44342.552083333336 | 7.61 |
| 44342.5625 | 7.56 |
| 44342.572916666664 | 7.6 |
| 44342.583333333336 | 7.62 |
| 44342.59375 | 7.6 |
| 44342.604166666664 | 7.6 |
| 44342.614583333336 | 7.6 |
| 44342.625 | 7.6 |
| 44342.635416666664 | 7.61 |
| 44342.645833333336 | 7.6 |
| 44342.65625 | 7.6 |
| 44342.666666666664 | 7.61 |
| 44342.677083333336 | 7.6 |
| 44342.6875 | 7.61 |
| 44342.697916666664 | 7.6 |
| 44342.708333333336 | 7.6 |
| 44342.71875 | 7.59 |
| 44342.729166666664 | 7.58 |
| 44342.739583333336 | 7.58 |
| 44342.75 | 7.56 |
| 44342.760416666664 | 7.56 |
| 44342.770833333336 | 7.57 |
| 44342.78125 | 7.56 |
| 44342.791666666664 | 7.56 |
| 44342.802083333336 | 7.56 |
| 44342.8125 | 7.56 |
| 44342.822916666664 | 7.57 |
| 44342.833333333336 | 7.55 |
| 44342.84375 | 7.54 |
| 44342.854166666664 | 7.57 |
| 44342.864583333336 | 7.61 |
| 44342.875 | 7.69 |
| 44342.885416666664 | 7.73 |
| 44342.895833333336 | 7.73 |
| 44342.90625 | 7.72 |
| 44342.916666666664 | 7.7 |
| 44342.927083333336 | 7.69 |
| 44342.9375 | 7.68 |
| 44342.947916666664 | 7.66 |
| 44342.958333333336 | 7.65 |
| 44342.96875 | 7.65 |
| 44342.979166666664 | 7.65 |
| 44342.989583333336 | 7.64 |
| 44343.0 | 7.64 |
| 44343.010416666664 | 7.64 |
| 44343.020833333336 | 7.64 |
| 44343.03125 | 7.63 |
| 44343.041666666664 | 7.63 |
| 44343.052083333336 | 7.63 |
| 44343.0625 | 7.64 |
| 44343.072916666664 | 7.63 |
| 44343.083333333336 | 7.62 |
| 44343.09375 | 7.62 |
| 44343.104166666664 | 7.62 |
| 44343.114583333336 | 7.62 |
| 44343.125 | 7.61 |
| 44343.135416666664 | 7.6 |
| 44343.145833333336 | 7.59 |
| 44343.15625 | 7.57 |
| 44343.166666666664 | 7.56 |
| 44343.177083333336 | 7.55 |
| 44343.1875 | 7.5 |
| 44343.197916666664 | 7.47 |
| 44343.208333333336 | 7.47 |
| 44343.21875 | 7.48 |
| 44343.229166666664 | 7.48 |
| 44343.239583333336 | 7.51 |
| 44343.25 | 7.51 |
| 44343.260416666664 | 7.51 |
| 44343.270833333336 | 7.5 |
| 44343.28125 | 7.5 |
| 44343.291666666664 | 7.47 |
| 44343.302083333336 | 7.46 |
| 44343.3125 | 7.45 |
| 44343.322916666664 | 7.45 |
| 44343.333333333336 | 7.45 |
| 44343.34375 | 7.45 |
| 44343.354166666664 | 7.45 |
| 44343.364583333336 | 7.43 |
| 44343.375 | 7.43 |
| 44343.385416666664 | 7.44 |
| 44343.395833333336 | 7.44 |
| 44343.40625 | 7.44 |
| 44343.416666666664 | 7.44 |
| 44343.427083333336 | 7.46 |
| 44343.4375 | 7.46 |
| 44343.447916666664 | 7.47 |
| 44343.458333333336 | 7.47 |
| 44343.46875 | 7.47 |
| 44343.479166666664 | 7.48 |
| 44343.489583333336 | 7.49 |
| 44343.5 | 7.5 |
| 44343.510416666664 | 7.51 |
| 44343.520833333336 | 7.52 |
| 44343.53125 | 7.53 |
| 44343.541666666664 | 7.55 |
| 44343.552083333336 | 7.56 |
| 44343.5625 | 7.55 |
| 44343.572916666664 | 7.56 |
| 44343.583333333336 | 7.57 |
| 44343.59375 | 7.52 |
| 44343.604166666664 | 7.54 |
| 44343.614583333336 | 7.56 |
| 44343.625 | 7.56 |
| 44343.635416666664 | 7.58 |
| 44343.645833333336 | 7.59 |
| 44343.65625 | 7.59 |
| 44343.666666666664 | 7.59 |
| 44343.677083333336 | 7.6 |
| 44343.6875 | 7.59 |
| 44343.697916666664 | 7.6 |
| 44343.708333333336 | 7.6 |
| 44343.71875 | 7.6 |
| 44343.729166666664 | 7.59 |
| 44343.739583333336 | 7.59 |
| 44343.75 | 7.58 |
| 44343.760416666664 | 7.57 |
| 44343.770833333336 | 7.57 |
| 44343.78125 | 7.57 |
| 44343.791666666664 | 7.57 |
| 44343.802083333336 | 7.57 |
| 44343.8125 | 7.56 |
| 44343.822916666664 | 7.57 |
| 44343.833333333336 | 7.58 |
| 44343.84375 | 7.59 |
| 44343.854166666664 | 7.57 |
| 44343.864583333336 | 7.56 |
| 44343.875 | 7.54 |
| 44343.885416666664 | 7.54 |
| 44343.895833333336 | 7.54 |
| 44343.90625 | 7.56 |
| 44343.916666666664 | 7.57 |
| 44343.927083333336 | 7.61 |
| 44343.9375 | 7.65 |
| 44343.947916666664 | 7.67 |
| 44343.958333333336 | 7.68 |
| 44343.96875 | 7.68 |
| 44343.979166666664 | 7.66 |
| 44343.989583333336 | 7.65 |
| 44344.0 | 7.64 |
| 44344.010416666664 | 7.64 |
| 44344.020833333336 | 7.64 |
| 44344.03125 | 7.63 |
| 44344.041666666664 | 7.63 |
| 44344.052083333336 | 7.62 |
| 44344.0625 | 7.61 |
| 44344.072916666664 | 7.62 |
| 44344.083333333336 | 7.62 |
| 44344.09375 | 7.62 |
| 44344.104166666664 | 7.62 |
| 44344.114583333336 | 7.61 |
| 44344.125 | 7.61 |
| 44344.135416666664 | 7.62 |
| 44344.145833333336 | 7.62 |
| 44344.15625 | 7.6 |
| 44344.166666666664 | 7.6 |
| 44344.177083333336 | 7.58 |
| 44344.1875 | 7.57 |
| 44344.197916666664 | 7.56 |
| 44344.208333333336 | 7.53 |
| 44344.21875 | 7.53 |
| 44344.229166666664 | 7.49 |
| 44344.239583333336 | 7.49 |
| 44344.25 | 7.48 |
| 44344.260416666664 | 7.5 |
| 44344.270833333336 | 7.48 |
| 44344.28125 | 7.51 |
| 44344.291666666664 | 7.51 |
| 44344.302083333336 | 7.5 |
| 44344.3125 | 7.48 |
| 44344.322916666664 | 7.47 |
| 44344.333333333336 | 7.44 |
| 44344.34375 | 7.41 |
| 44344.354166666664 | 7.38 |
| 44344.364583333336 | 7.35 |
| 44344.375 | 7.34 |
| 44344.385416666664 | 7.34 |
| 44344.395833333336 | 7.35 |
| 44344.40625 | 7.34 |
| 44344.416666666664 | 7.35 |
| 44344.427083333336 | 7.37 |
| 44344.4375 | 7.38 |
| 44344.447916666664 | 7.4 |
| 44344.458333333336 | 7.42 |
| 44344.46875 | 7.43 |
| 44344.479166666664 | 7.44 |
| 44344.489583333336 | 7.44 |
| 44344.5 | 7.45 |
| 44344.510416666664 | 7.45 |
| 44344.520833333336 | 7.46 |
| 44344.53125 | 7.47 |
| 44344.541666666664 | 7.49 |
| 44344.552083333336 | 7.5 |
| 44344.5625 | 7.52 |
| 44344.572916666664 | 7.54 |
| 44344.583333333336 | 7.56 |
| 44344.59375 | 7.57 |
| 44344.604166666664 | 7.57 |
| 44344.614583333336 | 7.58 |
| 44344.625 | 7.57 |
| 44344.635416666664 | 7.54 |
| 44344.645833333336 | 7.55 |
| 44344.65625 | 7.58 |
| 44344.666666666664 | 7.6 |
| 44344.677083333336 | 7.6 |
| 44344.6875 | 7.6 |
| 44344.697916666664 | 7.6 |
| 44344.708333333336 | 7.6 |
| 44344.71875 | 7.61 |
| 44344.729166666664 | 7.61 |
| 44344.739583333336 | 7.61 |
| 44344.75 | 7.61 |
| 44344.760416666664 | 7.61 |
| 44344.770833333336 | 7.61 |
| 44344.78125 | 7.62 |
| 44344.791666666664 | 7.63 |
| 44344.802083333336 | 7.62 |
| 44344.8125 | 7.62 |
| 44344.822916666664 | 7.62 |
| 44344.833333333336 | 7.58 |
| 44344.84375 | 7.56 |
| 44344.854166666664 | 7.55 |
| 44344.864583333336 | 7.54 |
| 44344.875 | 7.54 |
| 44344.885416666664 | 7.55 |
| 44344.895833333336 | 7.54 |
| 44344.90625 | 7.55 |
| 44344.916666666664 | 7.55 |
| 44344.927083333336 | 7.55 |
| 44344.9375 | 7.57 |
| 44344.947916666664 | 7.58 |
| 44344.958333333336 | 7.58 |
| 44344.96875 | 7.59 |
| 44344.979166666664 | 7.58 |
| 44344.989583333336 | 7.58 |
| 44345.0 | 7.58 |
| 44345.010416666664 | 7.58 |
| 44345.020833333336 | 7.59 |
| 44345.03125 | 7.59 |
| 44345.041666666664 | 7.59 |
| 44345.052083333336 | 7.6 |
| 44345.0625 | 7.6 |
| 44345.072916666664 | 7.6 |
| 44345.083333333336 | 7.59 |
| 44345.09375 | 7.58 |
| 44345.104166666664 | 7.58 |
| 44345.114583333336 | 7.58 |
| 44345.125 | 7.58 |
| 44345.135416666664 | 7.59 |
| 44345.145833333336 | 7.6 |
| 44345.15625 | 7.6 |
| 44345.166666666664 | 7.61 |
| 44345.177083333336 | 7.58 |
| 44345.1875 | 7.61 |
| 44345.197916666664 | 7.58 |
| 44345.208333333336 | 7.56 |
| 44345.21875 | 7.54 |
| 44345.229166666664 | 7.53 |
| 44345.239583333336 | 7.52 |
| 44345.25 | 7.5 |
| 44345.260416666664 | 7.49 |
| 44345.270833333336 | 7.47 |
| 44345.28125 | 7.46 |
| 44345.291666666664 | 7.43 |
| 44345.302083333336 | 7.4 |
| 44345.3125 | 7.4 |
| 44345.322916666664 | 7.38 |
| 44345.333333333336 | 7.4 |
| 44345.34375 | 7.36 |
| 44345.354166666664 | 7.37 |
| 44345.364583333336 | 7.36 |
| 44345.375 | 7.39 |
| 44345.385416666664 | 7.39 |
| 44345.395833333336 | 7.38 |
| 44345.40625 | 7.35 |
| 44345.416666666664 | 7.33 |
| 44345.427083333336 | 7.32 |
| 44345.4375 | 7.33 |
| 44345.447916666664 | 7.34 |
| 44345.458333333336 | 7.34 |
| 44345.46875 | 7.35 |
| 44345.479166666664 | 7.37 |
| 44345.489583333336 | 7.39 |
| 44345.5 | 7.42 |
| 44345.510416666664 | 7.47 |
| 44345.520833333336 | 7.47 |
| 44345.53125 | 7.46 |
| 44345.541666666664 | 7.48 |
| 44345.552083333336 | 7.49 |
| 44345.5625 | 7.53 |
| 44345.572916666664 | 7.53 |
| 44345.583333333336 | 7.53 |
| 44345.59375 | 7.56 |
| 44345.604166666664 | 7.57 |
| 44345.614583333336 | 7.59 |
| 44345.625 | 7.6 |
| 44345.635416666664 | 7.61 |
| 44345.645833333336 | 7.62 |
| 44345.65625 | 7.63 |
| 44345.666666666664 | 7.58 |
| 44345.677083333336 | 7.53 |
| 44345.6875 | 7.52 |
| 44345.697916666664 | 7.54 |
| 44345.708333333336 | 7.55 |
| 44345.71875 | 7.55 |
| 44345.729166666664 | 7.56 |
| 44345.739583333336 | 7.56 |
| 44345.75 | 7.56 |
| 44345.760416666664 | 7.55 |
| 44345.770833333336 | 7.57 |
| 44345.78125 | 7.58 |
| 44345.791666666664 | 7.57 |
| 44345.802083333336 | 7.58 |
| 44345.8125 | 7.57 |
| 44345.822916666664 | 7.57 |
| 44345.833333333336 | 7.57 |
| 44345.84375 | 7.56 |
| 44345.854166666664 | 7.55 |
| 44345.864583333336 | 7.54 |
| 44345.875 | 7.54 |
| 44345.885416666664 | 7.53 |
| 44345.895833333336 | 7.54 |
| 44345.90625 | 7.54 |
| 44345.916666666664 | 7.53 |
| 44345.927083333336 | 7.53 |
| 44345.9375 | 7.53 |
| 44345.947916666664 | 7.52 |
| 44345.958333333336 | 7.53 |
| 44345.96875 | 7.52 |
| 44345.979166666664 | 7.52 |
| 44345.989583333336 | 7.52 |
| 44346.0 | 7.53 |
| 44346.010416666664 | 7.56 |
| 44346.020833333336 | 7.58 |
| 44346.03125 | 7.6 |
| 44346.041666666664 | 7.62 |
| 44346.052083333336 | 7.63 |
| 44346.0625 | 7.64 |
| 44346.072916666664 | 7.66 |
| 44346.083333333336 | 7.66 |
| 44346.09375 | 7.67 |
| 44346.104166666664 | 7.67 |
| 44346.114583333336 | 7.68 |
| 44346.125 | 7.68 |
| 44346.135416666664 | 7.69 |
| 44346.145833333336 | 7.69 |
| 44346.15625 | 7.69 |
| 44346.166666666664 | 7.65 |
| 44346.177083333336 | 7.64 |
| 44346.1875 | 7.64 |
| 44346.197916666664 | 7.62 |
| 44346.208333333336 | 7.6 |
| 44346.21875 | 7.59 |
| 44346.229166666664 | 7.59 |
| 44346.239583333336 | 7.58 |
| 44346.25 | 7.58 |
| 44346.260416666664 | 7.57 |
| 44346.270833333336 | 7.57 |
| 44346.28125 | 7.55 |
| 44346.291666666664 | 7.55 |
| 44346.302083333336 | 7.55 |
| 44346.3125 | 7.56 |
| 44346.322916666664 | 7.56 |
| 44346.333333333336 | 7.58 |
| 44346.34375 | 7.56 |
| 44346.354166666664 | 7.57 |
| 44346.364583333336 | 7.57 |
| 44346.375 | 7.55 |
| 44346.385416666664 | 7.57 |
| 44346.395833333336 | 7.53 |
| 44346.40625 | 7.52 |
| 44346.416666666664 | 7.5 |
| 44346.427083333336 | 7.53 |
| 44346.4375 | 7.53 |
| 44346.447916666664 | 7.51 |
| 44346.458333333336 | 7.51 |
| 44346.46875 | 7.5 |
| 44346.479166666664 | 7.5 |
| 44346.489583333336 | 7.48 |
| 44346.5 | 7.46 |
| 44346.510416666664 | 7.5 |
| 44346.520833333336 | 7.5 |
| 44346.53125 | 7.52 |
| 44346.541666666664 | 7.55 |
| 44346.552083333336 | 7.58 |
| 44346.5625 | 7.62 |
| 44346.572916666664 | 7.65 |
| 44346.583333333336 | 7.67 |
| 44346.59375 | 7.68 |
| 44346.604166666664 | 7.68 |
| 44346.614583333336 | 7.69 |
| 44346.625 | 7.69 |
| 44346.635416666664 | 7.69 |
| 44346.645833333336 | 7.69 |
| 44346.65625 | 7.68 |
| 44346.666666666664 | 7.68 |
| 44346.677083333336 | 7.68 |
| 44346.6875 | 7.68 |
| 44346.697916666664 | 7.68 |
| 44346.708333333336 | 7.67 |
| 44346.71875 | 7.65 |
| 44346.729166666664 | 7.64 |
| 44346.739583333336 | 7.69 |
| 44346.75 | 7.68 |
| 44346.760416666664 | 7.69 |
| 44346.770833333336 | 7.69 |
| 44346.78125 | 7.68 |
| 44346.791666666664 | 7.68 |
| 44346.802083333336 | 7.68 |
| 44346.8125 | 7.67 |
| 44346.822916666664 | 7.66 |
| 44346.833333333336 | 7.65 |
| 44346.84375 | 7.64 |
| 44346.854166666664 | 7.63 |
| 44346.864583333336 | 7.62 |
| 44346.875 | 7.63 |
| 44346.885416666664 | 7.62 |
| 44346.895833333336 | 7.61 |
| 44346.90625 | 7.6 |
| 44346.916666666664 | 7.6 |
| 44346.927083333336 | 7.59 |
| 44346.9375 | 7.57 |
| 44346.947916666664 | 7.52 |
| 44346.958333333336 | 7.51 |
| 44346.96875 | 7.47 |
| 44346.979166666664 | 7.51 |
| 44346.989583333336 | 7.51 |
| 44347.0 | 7.5 |
| 44347.010416666664 | 7.51 |
| 44347.020833333336 | 7.54 |
| 44347.03125 | 7.58 |
| 44347.041666666664 | 7.61 |
| 44347.052083333336 | 7.64 |
| 44347.0625 | 7.63 |
| 44347.072916666664 | 7.63 |
| 44347.083333333336 | 7.64 |
| 44347.09375 | 7.64 |
| 44347.104166666664 | 7.64 |
| 44347.114583333336 | 7.64 |
| 44347.125 | 7.65 |
| 44347.135416666664 | 7.65 |
| 44347.145833333336 | 7.67 |
| 44347.15625 | 7.68 |
| 44347.166666666664 | 7.69 |
| 44347.177083333336 | 7.69 |
| 44347.1875 | 7.7 |
| 44347.197916666664 | 7.7 |
| 44347.208333333336 | 7.7 |
| 44347.21875 | 7.7 |
| 44347.229166666664 | 7.7 |
| 44347.239583333336 | 7.68 |
| 44347.25 | 7.67 |
| 44347.260416666664 | 7.67 |
| 44347.270833333336 | 7.66 |
| 44347.28125 | 7.64 |
| 44347.291666666664 | 7.63 |
| 44347.302083333336 | 7.62 |
| 44347.3125 | 7.61 |
| 44347.322916666664 | 7.59 |
| 44347.333333333336 | 7.58 |
| 44347.34375 | 7.57 |
| 44347.354166666664 | 7.53 |
| 44347.364583333336 | 7.5 |
| 44347.375 | 7.5 |
| 44347.385416666664 | 7.44 |
| 44347.395833333336 | 7.42 |
| 44347.40625 | 7.42 |
| 44347.416666666664 | 7.41 |
| 44347.427083333336 | 7.45 |
| 44347.4375 | 7.42 |
| 44347.447916666664 | 7.44 |
| 44347.458333333336 | 7.43 |
| 44347.46875 | 7.41 |
| 44347.479166666664 | 7.4 |
| 44347.489583333336 | 7.39 |
| 44347.5 | 7.38 |
| 44347.510416666664 | 7.38 |
| 44347.520833333336 | 7.39 |
| 44347.53125 | 7.4 |
| 44347.541666666664 | 7.4 |
| 44347.552083333336 | 7.41 |
| 44347.5625 | 7.43 |
| 44347.572916666664 | 7.45 |
| 44347.583333333336 | 7.49 |
| 44347.59375 | 7.53 |
| 44347.604166666664 | 7.57 |
| 44347.614583333336 | 7.58 |
| 44347.625 | 7.59 |
| 44347.635416666664 | 7.6 |
| 44347.645833333336 | 7.6 |
| 44347.65625 | 7.61 |
| 44347.666666666664 | 7.62 |
| 44347.677083333336 | 7.63 |
| 44347.6875 | 7.64 |
| 44347.697916666664 | 7.64 |
| 44347.708333333336 | 7.66 |
| 44347.71875 | 7.67 |
| 44347.729166666664 | 7.68 |
| 44347.739583333336 | 7.67 |
| 44347.75 | 7.67 |
| 44347.760416666664 | 7.64 |
| 44347.770833333336 | 7.71 |
| 44347.78125 | 7.71 |
| 44347.791666666664 | 7.72 |
| 44347.802083333336 | 7.73 |
| 44347.8125 | 7.73 |
| 44347.822916666664 | 7.73 |
| 44347.833333333336 | 7.73 |
| 44347.84375 | 7.74 |
| 44347.854166666664 | 7.73 |
| 44347.864583333336 | 7.74 |
| 44347.875 | 7.73 |
| 44347.885416666664 | 7.73 |
| 44347.895833333336 | 7.72 |
| 44347.90625 | 7.71 |
| 44347.916666666664 | 7.7 |
| 44347.927083333336 | 7.7 |
| 44347.9375 | 7.68 |
| 44347.947916666664 | 7.68 |
| 44347.958333333336 | 7.65 |
| 44347.96875 | 7.62 |
| 44347.979166666664 | 7.59 |
| 44347.989583333336 | 7.58 |
| 44348.0 | 7.58 |
| 44348.010416666664 | 7.6 |
| 44348.020833333336 | 7.59 |
| 44348.03125 | 7.59 |
| 44348.041666666664 | 7.59 |
| 44348.052083333336 | 7.61 |
| 44348.0625 | 7.63 |
| 44348.072916666664 | 7.65 |
| 44348.083333333336 | 7.67 |
| 44348.09375 | 7.68 |
| 44348.104166666664 | 7.68 |
| 44348.114583333336 | 7.68 |
| 44348.125 | 7.68 |
| 44348.135416666664 | 7.68 |
| 44348.145833333336 | 7.68 |
| 44348.15625 | 7.68 |